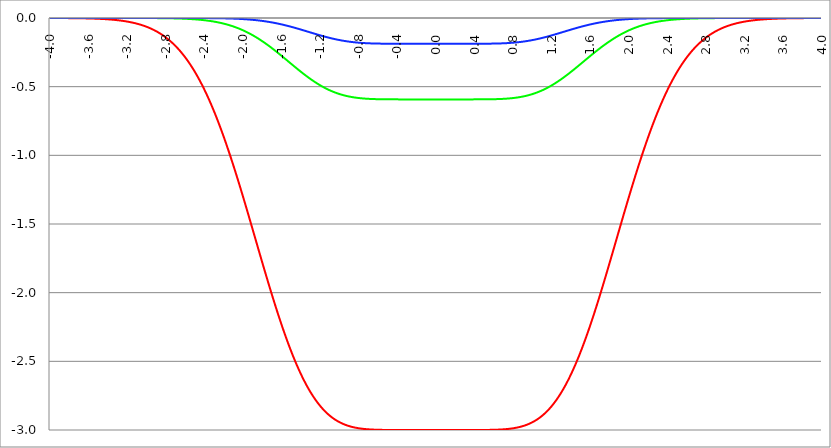
| Category | Series 1 | Series 0 | Series 2 |
|---|---|---|---|
| -4.0 | 0 | 0 | 0 |
| -3.996 | 0 | 0 | 0 |
| -3.992 | 0 | 0 | 0 |
| -3.988 | 0 | 0 | 0 |
| -3.984 | 0 | 0 | 0 |
| -3.98 | 0 | 0 | 0 |
| -3.976 | 0 | 0 | 0 |
| -3.972 | 0 | 0 | 0 |
| -3.968 | 0 | 0 | 0 |
| -3.964 | 0 | 0 | 0 |
| -3.96 | 0 | 0 | 0 |
| -3.956 | 0 | 0 | 0 |
| -3.952 | 0 | 0 | 0 |
| -3.948 | 0 | 0 | 0 |
| -3.944 | 0 | 0 | 0 |
| -3.94 | 0 | 0 | 0 |
| -3.936 | 0 | 0 | 0 |
| -3.932 | 0 | 0 | 0 |
| -3.928 | 0 | 0 | 0 |
| -3.924 | 0 | 0 | 0 |
| -3.92 | 0 | 0 | 0 |
| -3.916 | 0 | 0 | 0 |
| -3.912 | 0 | 0 | 0 |
| -3.908 | -0.001 | 0 | 0 |
| -3.904 | -0.001 | 0 | 0 |
| -3.9 | -0.001 | 0 | 0 |
| -3.896 | -0.001 | 0 | 0 |
| -3.892 | -0.001 | 0 | 0 |
| -3.888 | -0.001 | 0 | 0 |
| -3.884 | -0.001 | 0 | 0 |
| -3.88 | -0.001 | 0 | 0 |
| -3.876 | -0.001 | 0 | 0 |
| -3.872 | -0.001 | 0 | 0 |
| -3.868 | -0.001 | 0 | 0 |
| -3.864 | -0.001 | 0 | 0 |
| -3.86 | -0.001 | 0 | 0 |
| -3.856 | -0.001 | 0 | 0 |
| -3.852 | -0.001 | 0 | 0 |
| -3.848 | -0.001 | 0 | 0 |
| -3.844 | -0.001 | 0 | 0 |
| -3.84 | -0.001 | 0 | 0 |
| -3.836 | -0.001 | 0 | 0 |
| -3.832 | -0.001 | 0 | 0 |
| -3.828 | -0.001 | 0 | 0 |
| -3.824 | -0.001 | 0 | 0 |
| -3.82 | -0.001 | 0 | 0 |
| -3.816 | -0.001 | 0 | 0 |
| -3.812 | -0.001 | 0 | 0 |
| -3.808 | -0.001 | 0 | 0 |
| -3.804 | -0.001 | 0 | 0 |
| -3.8 | -0.001 | 0 | 0 |
| -3.796 | -0.001 | 0 | 0 |
| -3.792 | -0.001 | 0 | 0 |
| -3.788 | -0.001 | 0 | 0 |
| -3.784 | -0.001 | 0 | 0 |
| -3.78 | -0.001 | 0 | 0 |
| -3.776 | -0.001 | 0 | 0 |
| -3.772 | -0.001 | 0 | 0 |
| -3.768 | -0.001 | 0 | 0 |
| -3.764 | -0.001 | 0 | 0 |
| -3.76 | -0.001 | 0 | 0 |
| -3.756 | -0.001 | 0 | 0 |
| -3.752 | -0.001 | 0 | 0 |
| -3.748 | -0.001 | 0 | 0 |
| -3.744 | -0.001 | 0 | 0 |
| -3.74 | -0.001 | 0 | 0 |
| -3.736 | -0.001 | 0 | 0 |
| -3.732 | -0.002 | 0 | 0 |
| -3.728 | -0.002 | 0 | 0 |
| -3.724 | -0.002 | 0 | 0 |
| -3.72 | -0.002 | 0 | 0 |
| -3.716 | -0.002 | 0 | 0 |
| -3.712 | -0.002 | 0 | 0 |
| -3.708 | -0.002 | 0 | 0 |
| -3.704 | -0.002 | 0 | 0 |
| -3.7 | -0.002 | 0 | 0 |
| -3.696 | -0.002 | 0 | 0 |
| -3.692 | -0.002 | 0 | 0 |
| -3.688 | -0.002 | 0 | 0 |
| -3.684 | -0.002 | 0 | 0 |
| -3.68 | -0.002 | 0 | 0 |
| -3.676 | -0.002 | 0 | 0 |
| -3.672 | -0.002 | 0 | 0 |
| -3.668 | -0.002 | 0 | 0 |
| -3.664 | -0.002 | 0 | 0 |
| -3.66 | -0.002 | 0 | 0 |
| -3.656 | -0.002 | 0 | 0 |
| -3.652 | -0.002 | 0 | 0 |
| -3.648 | -0.002 | 0 | 0 |
| -3.644 | -0.003 | 0 | 0 |
| -3.64 | -0.003 | 0 | 0 |
| -3.636 | -0.003 | 0 | 0 |
| -3.632 | -0.003 | 0 | 0 |
| -3.628 | -0.003 | 0 | 0 |
| -3.624 | -0.003 | 0 | 0 |
| -3.62 | -0.003 | 0 | 0 |
| -3.616 | -0.003 | 0 | 0 |
| -3.612 | -0.003 | 0 | 0 |
| -3.608 | -0.003 | 0 | 0 |
| -3.604 | -0.003 | 0 | 0 |
| -3.6 | -0.003 | 0 | 0 |
| -3.596 | -0.003 | 0 | 0 |
| -3.592 | -0.003 | 0 | 0 |
| -3.588 | -0.003 | 0 | 0 |
| -3.584 | -0.004 | 0 | 0 |
| -3.58 | -0.004 | 0 | 0 |
| -3.576 | -0.004 | 0 | 0 |
| -3.572 | -0.004 | 0 | 0 |
| -3.568 | -0.004 | 0 | 0 |
| -3.564 | -0.004 | 0 | 0 |
| -3.56 | -0.004 | 0 | 0 |
| -3.556 | -0.004 | 0 | 0 |
| -3.552 | -0.004 | 0 | 0 |
| -3.548 | -0.004 | 0 | 0 |
| -3.544 | -0.004 | 0 | 0 |
| -3.54 | -0.005 | 0 | 0 |
| -3.536 | -0.005 | 0 | 0 |
| -3.532 | -0.005 | 0 | 0 |
| -3.528 | -0.005 | 0 | 0 |
| -3.524 | -0.005 | 0 | 0 |
| -3.52 | -0.005 | 0 | 0 |
| -3.516 | -0.005 | 0 | 0 |
| -3.512 | -0.005 | 0 | 0 |
| -3.508 | -0.005 | 0 | 0 |
| -3.504 | -0.006 | 0 | 0 |
| -3.5 | -0.006 | 0 | 0 |
| -3.496 | -0.006 | 0 | 0 |
| -3.492 | -0.006 | 0 | 0 |
| -3.488 | -0.006 | 0 | 0 |
| -3.484 | -0.006 | 0 | 0 |
| -3.48 | -0.006 | 0 | 0 |
| -3.476 | -0.006 | 0 | 0 |
| -3.472 | -0.007 | 0 | 0 |
| -3.467999999999999 | -0.007 | 0 | 0 |
| -3.463999999999999 | -0.007 | 0 | 0 |
| -3.459999999999999 | -0.007 | 0 | 0 |
| -3.455999999999999 | -0.007 | 0 | 0 |
| -3.451999999999999 | -0.007 | 0 | 0 |
| -3.447999999999999 | -0.007 | 0 | 0 |
| -3.443999999999999 | -0.008 | 0 | 0 |
| -3.439999999999999 | -0.008 | 0 | 0 |
| -3.435999999999999 | -0.008 | 0 | 0 |
| -3.431999999999999 | -0.008 | 0 | 0 |
| -3.427999999999999 | -0.008 | 0 | 0 |
| -3.423999999999999 | -0.009 | 0 | 0 |
| -3.419999999999999 | -0.009 | 0 | 0 |
| -3.415999999999999 | -0.009 | 0 | 0 |
| -3.411999999999999 | -0.009 | 0 | 0 |
| -3.407999999999999 | -0.009 | 0 | 0 |
| -3.403999999999999 | -0.009 | 0 | 0 |
| -3.399999999999999 | -0.01 | 0 | 0 |
| -3.395999999999999 | -0.01 | 0 | 0 |
| -3.391999999999999 | -0.01 | 0 | 0 |
| -3.387999999999999 | -0.01 | 0 | 0 |
| -3.383999999999999 | -0.01 | 0 | 0 |
| -3.379999999999999 | -0.011 | 0 | 0 |
| -3.375999999999999 | -0.011 | 0 | 0 |
| -3.371999999999999 | -0.011 | 0 | 0 |
| -3.367999999999999 | -0.011 | 0 | 0 |
| -3.363999999999999 | -0.012 | 0 | 0 |
| -3.359999999999999 | -0.012 | 0 | 0 |
| -3.355999999999999 | -0.012 | 0 | 0 |
| -3.351999999999999 | -0.012 | 0 | 0 |
| -3.347999999999999 | -0.013 | 0 | 0 |
| -3.343999999999999 | -0.013 | 0 | 0 |
| -3.339999999999999 | -0.013 | 0 | 0 |
| -3.335999999999999 | -0.013 | 0 | 0 |
| -3.331999999999999 | -0.014 | 0 | 0 |
| -3.327999999999999 | -0.014 | 0 | 0 |
| -3.323999999999999 | -0.014 | 0 | 0 |
| -3.319999999999999 | -0.015 | 0 | 0 |
| -3.315999999999999 | -0.015 | 0 | 0 |
| -3.311999999999999 | -0.015 | 0 | 0 |
| -3.307999999999999 | -0.015 | 0 | 0 |
| -3.303999999999999 | -0.016 | 0 | 0 |
| -3.299999999999999 | -0.016 | 0 | 0 |
| -3.295999999999999 | -0.016 | 0 | 0 |
| -3.291999999999999 | -0.017 | 0 | 0 |
| -3.288 | -0.017 | 0 | 0 |
| -3.284 | -0.017 | 0 | 0 |
| -3.279999999999999 | -0.018 | 0 | 0 |
| -3.275999999999999 | -0.018 | 0 | 0 |
| -3.271999999999999 | -0.018 | 0 | 0 |
| -3.268 | -0.019 | 0 | 0 |
| -3.264 | -0.019 | 0 | 0 |
| -3.259999999999999 | -0.019 | 0 | 0 |
| -3.255999999999999 | -0.02 | 0 | 0 |
| -3.251999999999999 | -0.02 | 0 | 0 |
| -3.248 | -0.021 | 0 | 0 |
| -3.244 | -0.021 | 0 | 0 |
| -3.239999999999999 | -0.021 | 0 | 0 |
| -3.235999999999999 | -0.022 | 0 | 0 |
| -3.231999999999999 | -0.022 | 0 | 0 |
| -3.228 | -0.023 | 0 | 0 |
| -3.224 | -0.023 | 0 | 0 |
| -3.219999999999999 | -0.024 | 0 | 0 |
| -3.215999999999999 | -0.024 | 0 | 0 |
| -3.211999999999999 | -0.025 | 0 | 0 |
| -3.208 | -0.025 | 0 | 0 |
| -3.204 | -0.026 | 0 | 0 |
| -3.199999999999999 | -0.026 | 0 | 0 |
| -3.195999999999999 | -0.026 | 0 | 0 |
| -3.191999999999999 | -0.027 | 0 | 0 |
| -3.188 | -0.028 | 0 | 0 |
| -3.184 | -0.028 | 0 | 0 |
| -3.179999999999999 | -0.029 | 0 | 0 |
| -3.175999999999999 | -0.029 | 0 | 0 |
| -3.171999999999999 | -0.03 | 0 | 0 |
| -3.168 | -0.03 | 0 | 0 |
| -3.164 | -0.031 | 0 | 0 |
| -3.159999999999999 | -0.031 | 0 | 0 |
| -3.155999999999999 | -0.032 | 0 | 0 |
| -3.151999999999999 | -0.033 | 0 | 0 |
| -3.148 | -0.033 | 0 | 0 |
| -3.144 | -0.034 | 0 | 0 |
| -3.139999999999999 | -0.034 | 0 | 0 |
| -3.135999999999999 | -0.035 | 0 | 0 |
| -3.131999999999999 | -0.036 | 0 | 0 |
| -3.128 | -0.036 | 0 | 0 |
| -3.124 | -0.037 | 0 | 0 |
| -3.119999999999999 | -0.038 | 0 | 0 |
| -3.115999999999999 | -0.038 | 0 | 0 |
| -3.111999999999999 | -0.039 | 0 | 0 |
| -3.108 | -0.04 | 0 | 0 |
| -3.104 | -0.04 | 0 | 0 |
| -3.099999999999999 | -0.041 | 0 | 0 |
| -3.095999999999999 | -0.042 | 0 | 0 |
| -3.091999999999999 | -0.043 | 0 | 0 |
| -3.088 | -0.043 | 0 | 0 |
| -3.084 | -0.044 | 0 | 0 |
| -3.079999999999999 | -0.045 | 0 | 0 |
| -3.075999999999999 | -0.046 | 0 | 0 |
| -3.071999999999999 | -0.047 | 0 | 0 |
| -3.068 | -0.047 | 0 | 0 |
| -3.064 | -0.048 | 0 | 0 |
| -3.059999999999999 | -0.049 | 0 | 0 |
| -3.055999999999999 | -0.05 | 0 | 0 |
| -3.051999999999999 | -0.051 | 0 | 0 |
| -3.048 | -0.052 | 0 | 0 |
| -3.044 | -0.053 | 0 | 0 |
| -3.039999999999999 | -0.054 | 0 | 0 |
| -3.035999999999999 | -0.055 | 0 | 0 |
| -3.031999999999999 | -0.056 | 0 | 0 |
| -3.028 | -0.056 | 0 | 0 |
| -3.024 | -0.057 | 0 | 0 |
| -3.019999999999999 | -0.058 | 0 | 0 |
| -3.015999999999999 | -0.059 | 0 | 0 |
| -3.011999999999999 | -0.061 | 0 | 0 |
| -3.008 | -0.062 | 0 | 0 |
| -3.004 | -0.063 | 0 | 0 |
| -2.999999999999999 | -0.064 | 0 | 0 |
| -2.995999999999999 | -0.065 | 0 | 0 |
| -2.991999999999999 | -0.066 | 0 | 0 |
| -2.988 | -0.067 | 0 | 0 |
| -2.984 | -0.068 | 0 | 0 |
| -2.979999999999999 | -0.069 | 0 | 0 |
| -2.975999999999999 | -0.07 | 0 | 0 |
| -2.971999999999999 | -0.072 | -0.001 | 0 |
| -2.968 | -0.073 | -0.001 | 0 |
| -2.964 | -0.074 | -0.001 | 0 |
| -2.959999999999999 | -0.075 | -0.001 | 0 |
| -2.955999999999999 | -0.077 | -0.001 | 0 |
| -2.951999999999999 | -0.078 | -0.001 | 0 |
| -2.948 | -0.079 | -0.001 | 0 |
| -2.944 | -0.08 | -0.001 | 0 |
| -2.939999999999999 | -0.082 | -0.001 | 0 |
| -2.935999999999999 | -0.083 | -0.001 | 0 |
| -2.931999999999999 | -0.084 | -0.001 | 0 |
| -2.928 | -0.086 | -0.001 | 0 |
| -2.924 | -0.087 | -0.001 | 0 |
| -2.919999999999999 | -0.089 | -0.001 | 0 |
| -2.915999999999999 | -0.09 | -0.001 | 0 |
| -2.911999999999999 | -0.092 | -0.001 | 0 |
| -2.908 | -0.093 | -0.001 | 0 |
| -2.904 | -0.095 | -0.001 | 0 |
| -2.899999999999999 | -0.096 | -0.001 | 0 |
| -2.895999999999999 | -0.098 | -0.001 | 0 |
| -2.891999999999999 | -0.099 | -0.001 | 0 |
| -2.887999999999999 | -0.101 | -0.001 | 0 |
| -2.883999999999999 | -0.102 | -0.001 | 0 |
| -2.879999999999999 | -0.104 | -0.001 | 0 |
| -2.875999999999999 | -0.106 | -0.001 | 0 |
| -2.871999999999999 | -0.107 | -0.001 | 0 |
| -2.867999999999999 | -0.109 | -0.001 | 0 |
| -2.863999999999999 | -0.111 | -0.001 | 0 |
| -2.859999999999999 | -0.113 | -0.001 | 0 |
| -2.855999999999999 | -0.114 | -0.001 | 0 |
| -2.851999999999999 | -0.116 | -0.001 | 0 |
| -2.847999999999999 | -0.118 | -0.001 | 0 |
| -2.843999999999999 | -0.12 | -0.001 | 0 |
| -2.839999999999999 | -0.122 | -0.001 | 0 |
| -2.835999999999999 | -0.124 | -0.001 | 0 |
| -2.831999999999999 | -0.125 | -0.001 | 0 |
| -2.827999999999999 | -0.127 | -0.001 | 0 |
| -2.823999999999999 | -0.129 | -0.001 | 0 |
| -2.819999999999999 | -0.131 | -0.001 | 0 |
| -2.815999999999999 | -0.133 | -0.001 | 0 |
| -2.811999999999999 | -0.135 | -0.002 | 0 |
| -2.807999999999999 | -0.137 | -0.002 | 0 |
| -2.803999999999999 | -0.139 | -0.002 | 0 |
| -2.799999999999999 | -0.142 | -0.002 | 0 |
| -2.795999999999999 | -0.144 | -0.002 | 0 |
| -2.791999999999999 | -0.146 | -0.002 | 0 |
| -2.787999999999999 | -0.148 | -0.002 | 0 |
| -2.783999999999999 | -0.15 | -0.002 | 0 |
| -2.779999999999999 | -0.153 | -0.002 | 0 |
| -2.775999999999999 | -0.155 | -0.002 | 0 |
| -2.771999999999999 | -0.157 | -0.002 | 0 |
| -2.767999999999999 | -0.159 | -0.002 | 0 |
| -2.763999999999999 | -0.162 | -0.002 | 0 |
| -2.759999999999999 | -0.164 | -0.002 | 0 |
| -2.755999999999999 | -0.167 | -0.002 | 0 |
| -2.751999999999999 | -0.169 | -0.002 | 0 |
| -2.747999999999999 | -0.172 | -0.002 | 0 |
| -2.743999999999999 | -0.174 | -0.002 | 0 |
| -2.739999999999999 | -0.177 | -0.002 | 0 |
| -2.735999999999999 | -0.179 | -0.002 | 0 |
| -2.731999999999999 | -0.182 | -0.003 | 0 |
| -2.727999999999999 | -0.184 | -0.003 | 0 |
| -2.723999999999999 | -0.187 | -0.003 | 0 |
| -2.719999999999999 | -0.19 | -0.003 | 0 |
| -2.715999999999999 | -0.192 | -0.003 | 0 |
| -2.711999999999999 | -0.195 | -0.003 | 0 |
| -2.707999999999999 | -0.198 | -0.003 | 0 |
| -2.703999999999999 | -0.201 | -0.003 | 0 |
| -2.699999999999999 | -0.204 | -0.003 | 0 |
| -2.695999999999999 | -0.206 | -0.003 | 0 |
| -2.691999999999999 | -0.209 | -0.003 | 0 |
| -2.687999999999999 | -0.212 | -0.003 | 0 |
| -2.683999999999999 | -0.215 | -0.003 | 0 |
| -2.679999999999999 | -0.218 | -0.003 | 0 |
| -2.675999999999999 | -0.221 | -0.004 | 0 |
| -2.671999999999999 | -0.224 | -0.004 | 0 |
| -2.667999999999999 | -0.227 | -0.004 | 0 |
| -2.663999999999999 | -0.231 | -0.004 | 0 |
| -2.659999999999999 | -0.234 | -0.004 | 0 |
| -2.655999999999999 | -0.237 | -0.004 | 0 |
| -2.651999999999999 | -0.24 | -0.004 | 0 |
| -2.647999999999999 | -0.243 | -0.004 | 0 |
| -2.643999999999999 | -0.247 | -0.004 | 0 |
| -2.639999999999999 | -0.25 | -0.004 | 0 |
| -2.635999999999999 | -0.253 | -0.004 | 0 |
| -2.631999999999999 | -0.257 | -0.005 | 0 |
| -2.627999999999999 | -0.26 | -0.005 | 0 |
| -2.623999999999999 | -0.264 | -0.005 | 0 |
| -2.619999999999999 | -0.267 | -0.005 | 0 |
| -2.615999999999999 | -0.271 | -0.005 | 0 |
| -2.611999999999999 | -0.274 | -0.005 | 0 |
| -2.607999999999999 | -0.278 | -0.005 | 0 |
| -2.603999999999999 | -0.282 | -0.005 | 0 |
| -2.599999999999999 | -0.285 | -0.006 | 0 |
| -2.595999999999999 | -0.289 | -0.006 | 0 |
| -2.591999999999999 | -0.293 | -0.006 | 0 |
| -2.587999999999999 | -0.297 | -0.006 | 0 |
| -2.583999999999999 | -0.301 | -0.006 | 0 |
| -2.579999999999999 | -0.305 | -0.006 | 0 |
| -2.575999999999999 | -0.309 | -0.006 | 0 |
| -2.571999999999999 | -0.312 | -0.006 | 0 |
| -2.567999999999999 | -0.317 | -0.007 | 0 |
| -2.563999999999999 | -0.321 | -0.007 | 0 |
| -2.559999999999999 | -0.325 | -0.007 | 0 |
| -2.555999999999999 | -0.329 | -0.007 | 0 |
| -2.551999999999999 | -0.333 | -0.007 | 0 |
| -2.547999999999999 | -0.337 | -0.007 | 0 |
| -2.543999999999999 | -0.341 | -0.008 | 0 |
| -2.539999999999999 | -0.346 | -0.008 | 0 |
| -2.535999999999999 | -0.35 | -0.008 | 0 |
| -2.531999999999999 | -0.354 | -0.008 | 0 |
| -2.527999999999999 | -0.359 | -0.008 | 0 |
| -2.523999999999999 | -0.363 | -0.008 | 0 |
| -2.519999999999999 | -0.368 | -0.009 | 0 |
| -2.515999999999999 | -0.372 | -0.009 | 0 |
| -2.511999999999999 | -0.377 | -0.009 | 0 |
| -2.507999999999999 | -0.381 | -0.009 | 0 |
| -2.503999999999999 | -0.386 | -0.009 | 0 |
| -2.499999999999999 | -0.391 | -0.01 | 0 |
| -2.495999999999999 | -0.395 | -0.01 | 0 |
| -2.491999999999999 | -0.4 | -0.01 | 0 |
| -2.487999999999999 | -0.405 | -0.01 | 0 |
| -2.483999999999999 | -0.41 | -0.01 | 0 |
| -2.479999999999999 | -0.415 | -0.011 | 0 |
| -2.475999999999999 | -0.42 | -0.011 | 0 |
| -2.471999999999999 | -0.425 | -0.011 | 0 |
| -2.467999999999999 | -0.43 | -0.011 | 0 |
| -2.463999999999999 | -0.435 | -0.012 | 0 |
| -2.459999999999999 | -0.44 | -0.012 | 0 |
| -2.455999999999999 | -0.445 | -0.012 | 0 |
| -2.451999999999999 | -0.45 | -0.012 | 0 |
| -2.447999999999999 | -0.456 | -0.013 | 0 |
| -2.443999999999999 | -0.461 | -0.013 | 0 |
| -2.439999999999999 | -0.466 | -0.013 | 0 |
| -2.435999999999999 | -0.472 | -0.013 | 0 |
| -2.431999999999999 | -0.477 | -0.014 | 0 |
| -2.427999999999999 | -0.482 | -0.014 | -0.001 |
| -2.423999999999999 | -0.488 | -0.014 | -0.001 |
| -2.419999999999999 | -0.493 | -0.015 | -0.001 |
| -2.415999999999999 | -0.499 | -0.015 | -0.001 |
| -2.411999999999999 | -0.505 | -0.015 | -0.001 |
| -2.407999999999999 | -0.51 | -0.016 | -0.001 |
| -2.403999999999999 | -0.516 | -0.016 | -0.001 |
| -2.399999999999999 | -0.522 | -0.016 | -0.001 |
| -2.395999999999999 | -0.528 | -0.017 | -0.001 |
| -2.391999999999999 | -0.533 | -0.017 | -0.001 |
| -2.387999999999999 | -0.539 | -0.017 | -0.001 |
| -2.383999999999999 | -0.545 | -0.018 | -0.001 |
| -2.379999999999999 | -0.551 | -0.018 | -0.001 |
| -2.375999999999999 | -0.557 | -0.018 | -0.001 |
| -2.371999999999999 | -0.563 | -0.019 | -0.001 |
| -2.367999999999998 | -0.569 | -0.019 | -0.001 |
| -2.363999999999998 | -0.576 | -0.019 | -0.001 |
| -2.359999999999998 | -0.582 | -0.02 | -0.001 |
| -2.355999999999998 | -0.588 | -0.02 | -0.001 |
| -2.351999999999998 | -0.594 | -0.021 | -0.001 |
| -2.347999999999998 | -0.601 | -0.021 | -0.001 |
| -2.343999999999998 | -0.607 | -0.021 | -0.001 |
| -2.339999999999998 | -0.613 | -0.022 | -0.001 |
| -2.335999999999998 | -0.62 | -0.022 | -0.001 |
| -2.331999999999998 | -0.626 | -0.023 | -0.001 |
| -2.327999999999998 | -0.633 | -0.023 | -0.001 |
| -2.323999999999998 | -0.64 | -0.023 | -0.001 |
| -2.319999999999998 | -0.646 | -0.024 | -0.001 |
| -2.315999999999998 | -0.653 | -0.024 | -0.001 |
| -2.311999999999998 | -0.66 | -0.025 | -0.001 |
| -2.307999999999998 | -0.666 | -0.025 | -0.001 |
| -2.303999999999998 | -0.673 | -0.026 | -0.001 |
| -2.299999999999998 | -0.68 | -0.026 | -0.001 |
| -2.295999999999998 | -0.687 | -0.027 | -0.001 |
| -2.291999999999998 | -0.694 | -0.027 | -0.001 |
| -2.287999999999998 | -0.701 | -0.028 | -0.001 |
| -2.283999999999998 | -0.708 | -0.028 | -0.001 |
| -2.279999999999998 | -0.715 | -0.029 | -0.001 |
| -2.275999999999998 | -0.722 | -0.029 | -0.001 |
| -2.271999999999998 | -0.729 | -0.03 | -0.002 |
| -2.267999999999998 | -0.736 | -0.03 | -0.002 |
| -2.263999999999998 | -0.743 | -0.031 | -0.002 |
| -2.259999999999998 | -0.751 | -0.032 | -0.002 |
| -2.255999999999998 | -0.758 | -0.032 | -0.002 |
| -2.251999999999998 | -0.765 | -0.033 | -0.002 |
| -2.247999999999998 | -0.773 | -0.033 | -0.002 |
| -2.243999999999998 | -0.78 | -0.034 | -0.002 |
| -2.239999999999998 | -0.788 | -0.034 | -0.002 |
| -2.235999999999998 | -0.795 | -0.035 | -0.002 |
| -2.231999999999998 | -0.803 | -0.036 | -0.002 |
| -2.227999999999998 | -0.81 | -0.036 | -0.002 |
| -2.223999999999998 | -0.818 | -0.037 | -0.002 |
| -2.219999999999998 | -0.826 | -0.038 | -0.002 |
| -2.215999999999998 | -0.833 | -0.038 | -0.002 |
| -2.211999999999998 | -0.841 | -0.039 | -0.002 |
| -2.207999999999998 | -0.849 | -0.04 | -0.002 |
| -2.203999999999998 | -0.857 | -0.04 | -0.002 |
| -2.199999999999998 | -0.865 | -0.041 | -0.002 |
| -2.195999999999998 | -0.873 | -0.042 | -0.003 |
| -2.191999999999998 | -0.88 | -0.042 | -0.003 |
| -2.187999999999998 | -0.888 | -0.043 | -0.003 |
| -2.183999999999998 | -0.896 | -0.044 | -0.003 |
| -2.179999999999998 | -0.905 | -0.045 | -0.003 |
| -2.175999999999998 | -0.913 | -0.045 | -0.003 |
| -2.171999999999998 | -0.921 | -0.046 | -0.003 |
| -2.167999999999998 | -0.929 | -0.047 | -0.003 |
| -2.163999999999998 | -0.937 | -0.048 | -0.003 |
| -2.159999999999998 | -0.945 | -0.049 | -0.003 |
| -2.155999999999998 | -0.954 | -0.049 | -0.003 |
| -2.151999999999998 | -0.962 | -0.05 | -0.003 |
| -2.147999999999998 | -0.97 | -0.051 | -0.003 |
| -2.143999999999998 | -0.979 | -0.052 | -0.003 |
| -2.139999999999998 | -0.987 | -0.053 | -0.004 |
| -2.135999999999998 | -0.996 | -0.054 | -0.004 |
| -2.131999999999998 | -1.004 | -0.054 | -0.004 |
| -2.127999999999998 | -1.013 | -0.055 | -0.004 |
| -2.123999999999998 | -1.021 | -0.056 | -0.004 |
| -2.119999999999998 | -1.03 | -0.057 | -0.004 |
| -2.115999999999998 | -1.038 | -0.058 | -0.004 |
| -2.111999999999998 | -1.047 | -0.059 | -0.004 |
| -2.107999999999998 | -1.056 | -0.06 | -0.004 |
| -2.103999999999998 | -1.064 | -0.061 | -0.004 |
| -2.099999999999998 | -1.073 | -0.062 | -0.005 |
| -2.095999999999998 | -1.082 | -0.063 | -0.005 |
| -2.091999999999998 | -1.091 | -0.064 | -0.005 |
| -2.087999999999998 | -1.1 | -0.065 | -0.005 |
| -2.083999999999998 | -1.108 | -0.066 | -0.005 |
| -2.079999999999998 | -1.117 | -0.067 | -0.005 |
| -2.075999999999998 | -1.126 | -0.068 | -0.005 |
| -2.071999999999998 | -1.135 | -0.069 | -0.005 |
| -2.067999999999998 | -1.144 | -0.07 | -0.005 |
| -2.063999999999998 | -1.153 | -0.071 | -0.006 |
| -2.059999999999998 | -1.162 | -0.072 | -0.006 |
| -2.055999999999998 | -1.171 | -0.073 | -0.006 |
| -2.051999999999998 | -1.18 | -0.074 | -0.006 |
| -2.047999999999998 | -1.189 | -0.075 | -0.006 |
| -2.043999999999998 | -1.199 | -0.076 | -0.006 |
| -2.039999999999998 | -1.208 | -0.078 | -0.006 |
| -2.035999999999998 | -1.217 | -0.079 | -0.007 |
| -2.031999999999998 | -1.226 | -0.08 | -0.007 |
| -2.027999999999998 | -1.235 | -0.081 | -0.007 |
| -2.023999999999998 | -1.245 | -0.082 | -0.007 |
| -2.019999999999998 | -1.254 | -0.083 | -0.007 |
| -2.015999999999998 | -1.263 | -0.085 | -0.007 |
| -2.011999999999998 | -1.272 | -0.086 | -0.007 |
| -2.007999999999998 | -1.282 | -0.087 | -0.008 |
| -2.003999999999998 | -1.291 | -0.088 | -0.008 |
| -1.999999999999998 | -1.3 | -0.09 | -0.008 |
| -1.995999999999998 | -1.31 | -0.091 | -0.008 |
| -1.991999999999998 | -1.319 | -0.092 | -0.008 |
| -1.987999999999998 | -1.329 | -0.093 | -0.008 |
| -1.983999999999998 | -1.338 | -0.095 | -0.009 |
| -1.979999999999998 | -1.348 | -0.096 | -0.009 |
| -1.975999999999998 | -1.357 | -0.097 | -0.009 |
| -1.971999999999998 | -1.366 | -0.099 | -0.009 |
| -1.967999999999998 | -1.376 | -0.1 | -0.009 |
| -1.963999999999998 | -1.386 | -0.102 | -0.01 |
| -1.959999999999998 | -1.395 | -0.103 | -0.01 |
| -1.955999999999998 | -1.405 | -0.104 | -0.01 |
| -1.951999999999998 | -1.414 | -0.106 | -0.01 |
| -1.947999999999998 | -1.424 | -0.107 | -0.01 |
| -1.943999999999998 | -1.433 | -0.109 | -0.011 |
| -1.939999999999998 | -1.443 | -0.11 | -0.011 |
| -1.935999999999998 | -1.452 | -0.112 | -0.011 |
| -1.931999999999998 | -1.462 | -0.113 | -0.011 |
| -1.927999999999998 | -1.472 | -0.115 | -0.012 |
| -1.923999999999998 | -1.481 | -0.116 | -0.012 |
| -1.919999999999998 | -1.491 | -0.118 | -0.012 |
| -1.915999999999998 | -1.501 | -0.119 | -0.012 |
| -1.911999999999998 | -1.51 | -0.121 | -0.013 |
| -1.907999999999998 | -1.52 | -0.122 | -0.013 |
| -1.903999999999998 | -1.53 | -0.124 | -0.013 |
| -1.899999999999998 | -1.539 | -0.125 | -0.013 |
| -1.895999999999998 | -1.549 | -0.127 | -0.014 |
| -1.891999999999998 | -1.559 | -0.129 | -0.014 |
| -1.887999999999998 | -1.568 | -0.13 | -0.014 |
| -1.883999999999998 | -1.578 | -0.132 | -0.014 |
| -1.879999999999998 | -1.588 | -0.133 | -0.015 |
| -1.875999999999998 | -1.597 | -0.135 | -0.015 |
| -1.871999999999998 | -1.607 | -0.137 | -0.015 |
| -1.867999999999998 | -1.617 | -0.138 | -0.016 |
| -1.863999999999998 | -1.626 | -0.14 | -0.016 |
| -1.859999999999998 | -1.636 | -0.142 | -0.016 |
| -1.855999999999998 | -1.646 | -0.144 | -0.016 |
| -1.851999999999998 | -1.655 | -0.145 | -0.017 |
| -1.847999999999998 | -1.665 | -0.147 | -0.017 |
| -1.843999999999998 | -1.675 | -0.149 | -0.017 |
| -1.839999999999998 | -1.685 | -0.151 | -0.018 |
| -1.835999999999998 | -1.694 | -0.152 | -0.018 |
| -1.831999999999998 | -1.704 | -0.154 | -0.018 |
| -1.827999999999998 | -1.714 | -0.156 | -0.019 |
| -1.823999999999998 | -1.723 | -0.158 | -0.019 |
| -1.819999999999998 | -1.733 | -0.16 | -0.019 |
| -1.815999999999998 | -1.742 | -0.162 | -0.02 |
| -1.811999999999998 | -1.752 | -0.163 | -0.02 |
| -1.807999999999998 | -1.762 | -0.165 | -0.02 |
| -1.803999999999998 | -1.771 | -0.167 | -0.021 |
| -1.799999999999998 | -1.781 | -0.169 | -0.021 |
| -1.795999999999998 | -1.79 | -0.171 | -0.022 |
| -1.791999999999998 | -1.8 | -0.173 | -0.022 |
| -1.787999999999998 | -1.81 | -0.175 | -0.022 |
| -1.783999999999998 | -1.819 | -0.177 | -0.023 |
| -1.779999999999998 | -1.829 | -0.179 | -0.023 |
| -1.775999999999998 | -1.838 | -0.181 | -0.024 |
| -1.771999999999998 | -1.848 | -0.183 | -0.024 |
| -1.767999999999998 | -1.857 | -0.185 | -0.024 |
| -1.763999999999998 | -1.867 | -0.187 | -0.025 |
| -1.759999999999998 | -1.876 | -0.189 | -0.025 |
| -1.755999999999998 | -1.886 | -0.191 | -0.026 |
| -1.751999999999998 | -1.895 | -0.193 | -0.026 |
| -1.747999999999998 | -1.904 | -0.195 | -0.027 |
| -1.743999999999998 | -1.914 | -0.197 | -0.027 |
| -1.739999999999998 | -1.923 | -0.199 | -0.027 |
| -1.735999999999998 | -1.932 | -0.201 | -0.028 |
| -1.731999999999998 | -1.942 | -0.203 | -0.028 |
| -1.727999999999998 | -1.951 | -0.205 | -0.029 |
| -1.723999999999998 | -1.96 | -0.207 | -0.029 |
| -1.719999999999998 | -1.97 | -0.209 | -0.03 |
| -1.715999999999998 | -1.979 | -0.211 | -0.03 |
| -1.711999999999998 | -1.988 | -0.213 | -0.031 |
| -1.707999999999998 | -1.997 | -0.216 | -0.031 |
| -1.703999999999998 | -2.006 | -0.218 | -0.032 |
| -1.699999999999998 | -2.016 | -0.22 | -0.032 |
| -1.695999999999998 | -2.025 | -0.222 | -0.033 |
| -1.691999999999998 | -2.034 | -0.224 | -0.033 |
| -1.687999999999998 | -2.043 | -0.226 | -0.034 |
| -1.683999999999998 | -2.052 | -0.228 | -0.034 |
| -1.679999999999998 | -2.061 | -0.231 | -0.035 |
| -1.675999999999998 | -2.07 | -0.233 | -0.035 |
| -1.671999999999998 | -2.079 | -0.235 | -0.036 |
| -1.667999999999998 | -2.088 | -0.237 | -0.036 |
| -1.663999999999998 | -2.097 | -0.239 | -0.037 |
| -1.659999999999998 | -2.105 | -0.242 | -0.038 |
| -1.655999999999998 | -2.114 | -0.244 | -0.038 |
| -1.651999999999998 | -2.123 | -0.246 | -0.039 |
| -1.647999999999998 | -2.132 | -0.248 | -0.039 |
| -1.643999999999998 | -2.14 | -0.251 | -0.04 |
| -1.639999999999998 | -2.149 | -0.253 | -0.04 |
| -1.635999999999998 | -2.158 | -0.255 | -0.041 |
| -1.631999999999998 | -2.166 | -0.257 | -0.042 |
| -1.627999999999998 | -2.175 | -0.26 | -0.042 |
| -1.623999999999998 | -2.184 | -0.262 | -0.043 |
| -1.619999999999998 | -2.192 | -0.264 | -0.043 |
| -1.615999999999998 | -2.201 | -0.267 | -0.044 |
| -1.611999999999998 | -2.209 | -0.269 | -0.045 |
| -1.607999999999998 | -2.217 | -0.271 | -0.045 |
| -1.603999999999998 | -2.226 | -0.273 | -0.046 |
| -1.599999999999998 | -2.234 | -0.276 | -0.047 |
| -1.595999999999998 | -2.242 | -0.278 | -0.047 |
| -1.591999999999998 | -2.251 | -0.28 | -0.048 |
| -1.587999999999998 | -2.259 | -0.283 | -0.049 |
| -1.583999999999998 | -2.267 | -0.285 | -0.049 |
| -1.579999999999998 | -2.275 | -0.287 | -0.05 |
| -1.575999999999998 | -2.283 | -0.29 | -0.051 |
| -1.571999999999998 | -2.291 | -0.292 | -0.051 |
| -1.567999999999998 | -2.299 | -0.294 | -0.052 |
| -1.563999999999998 | -2.307 | -0.297 | -0.053 |
| -1.559999999999998 | -2.315 | -0.299 | -0.053 |
| -1.555999999999998 | -2.323 | -0.301 | -0.054 |
| -1.551999999999998 | -2.331 | -0.304 | -0.055 |
| -1.547999999999998 | -2.338 | -0.306 | -0.055 |
| -1.543999999999998 | -2.346 | -0.308 | -0.056 |
| -1.539999999999998 | -2.354 | -0.311 | -0.057 |
| -1.535999999999998 | -2.362 | -0.313 | -0.058 |
| -1.531999999999998 | -2.369 | -0.315 | -0.058 |
| -1.527999999999998 | -2.377 | -0.318 | -0.059 |
| -1.523999999999998 | -2.384 | -0.32 | -0.06 |
| -1.519999999999998 | -2.392 | -0.322 | -0.06 |
| -1.515999999999998 | -2.399 | -0.325 | -0.061 |
| -1.511999999999998 | -2.406 | -0.327 | -0.062 |
| -1.507999999999998 | -2.414 | -0.329 | -0.063 |
| -1.503999999999998 | -2.421 | -0.332 | -0.063 |
| -1.499999999999998 | -2.428 | -0.334 | -0.064 |
| -1.495999999999998 | -2.435 | -0.336 | -0.065 |
| -1.491999999999998 | -2.443 | -0.339 | -0.066 |
| -1.487999999999998 | -2.45 | -0.341 | -0.066 |
| -1.483999999999998 | -2.457 | -0.343 | -0.067 |
| -1.479999999999998 | -2.464 | -0.346 | -0.068 |
| -1.475999999999998 | -2.471 | -0.348 | -0.069 |
| -1.471999999999998 | -2.478 | -0.35 | -0.07 |
| -1.467999999999998 | -2.484 | -0.353 | -0.07 |
| -1.463999999999998 | -2.491 | -0.355 | -0.071 |
| -1.459999999999998 | -2.498 | -0.357 | -0.072 |
| -1.455999999999998 | -2.505 | -0.36 | -0.073 |
| -1.451999999999998 | -2.511 | -0.362 | -0.074 |
| -1.447999999999998 | -2.518 | -0.364 | -0.074 |
| -1.443999999999998 | -2.524 | -0.367 | -0.075 |
| -1.439999999999998 | -2.531 | -0.369 | -0.076 |
| -1.435999999999998 | -2.537 | -0.371 | -0.077 |
| -1.431999999999998 | -2.544 | -0.373 | -0.078 |
| -1.427999999999998 | -2.55 | -0.376 | -0.078 |
| -1.423999999999998 | -2.556 | -0.378 | -0.079 |
| -1.419999999999998 | -2.562 | -0.38 | -0.08 |
| -1.415999999999998 | -2.569 | -0.383 | -0.081 |
| -1.411999999999998 | -2.575 | -0.385 | -0.082 |
| -1.407999999999998 | -2.581 | -0.387 | -0.083 |
| -1.403999999999998 | -2.587 | -0.389 | -0.083 |
| -1.399999999999998 | -2.593 | -0.392 | -0.084 |
| -1.395999999999998 | -2.599 | -0.394 | -0.085 |
| -1.391999999999998 | -2.605 | -0.396 | -0.086 |
| -1.387999999999998 | -2.61 | -0.398 | -0.087 |
| -1.383999999999998 | -2.616 | -0.4 | -0.088 |
| -1.379999999999998 | -2.622 | -0.403 | -0.088 |
| -1.375999999999998 | -2.627 | -0.405 | -0.089 |
| -1.371999999999998 | -2.633 | -0.407 | -0.09 |
| -1.367999999999998 | -2.639 | -0.409 | -0.091 |
| -1.363999999999998 | -2.644 | -0.411 | -0.092 |
| -1.359999999999998 | -2.65 | -0.413 | -0.093 |
| -1.355999999999998 | -2.655 | -0.416 | -0.094 |
| -1.351999999999998 | -2.66 | -0.418 | -0.094 |
| -1.347999999999998 | -2.666 | -0.42 | -0.095 |
| -1.343999999999998 | -2.671 | -0.422 | -0.096 |
| -1.339999999999998 | -2.676 | -0.424 | -0.097 |
| -1.335999999999998 | -2.681 | -0.426 | -0.098 |
| -1.331999999999998 | -2.686 | -0.428 | -0.099 |
| -1.327999999999998 | -2.691 | -0.43 | -0.1 |
| -1.323999999999998 | -2.696 | -0.432 | -0.1 |
| -1.319999999999998 | -2.701 | -0.434 | -0.101 |
| -1.315999999999998 | -2.706 | -0.436 | -0.102 |
| -1.311999999999998 | -2.711 | -0.438 | -0.103 |
| -1.307999999999998 | -2.716 | -0.44 | -0.104 |
| -1.303999999999998 | -2.72 | -0.442 | -0.105 |
| -1.299999999999998 | -2.725 | -0.444 | -0.106 |
| -1.295999999999998 | -2.73 | -0.446 | -0.106 |
| -1.291999999999998 | -2.734 | -0.448 | -0.107 |
| -1.287999999999998 | -2.739 | -0.45 | -0.108 |
| -1.283999999999998 | -2.743 | -0.452 | -0.109 |
| -1.279999999999998 | -2.747 | -0.454 | -0.11 |
| -1.275999999999998 | -2.752 | -0.456 | -0.111 |
| -1.271999999999998 | -2.756 | -0.458 | -0.111 |
| -1.267999999999998 | -2.76 | -0.46 | -0.112 |
| -1.263999999999998 | -2.765 | -0.462 | -0.113 |
| -1.259999999999998 | -2.769 | -0.464 | -0.114 |
| -1.255999999999998 | -2.773 | -0.466 | -0.115 |
| -1.251999999999998 | -2.777 | -0.467 | -0.116 |
| -1.247999999999998 | -2.781 | -0.469 | -0.117 |
| -1.243999999999998 | -2.785 | -0.471 | -0.117 |
| -1.239999999999998 | -2.789 | -0.473 | -0.118 |
| -1.235999999999998 | -2.793 | -0.475 | -0.119 |
| -1.231999999999998 | -2.796 | -0.476 | -0.12 |
| -1.227999999999998 | -2.8 | -0.478 | -0.121 |
| -1.223999999999998 | -2.804 | -0.48 | -0.122 |
| -1.219999999999998 | -2.807 | -0.482 | -0.122 |
| -1.215999999999998 | -2.811 | -0.483 | -0.123 |
| -1.211999999999998 | -2.815 | -0.485 | -0.124 |
| -1.207999999999998 | -2.818 | -0.487 | -0.125 |
| -1.203999999999998 | -2.822 | -0.489 | -0.126 |
| -1.199999999999997 | -2.825 | -0.49 | -0.126 |
| -1.195999999999997 | -2.828 | -0.492 | -0.127 |
| -1.191999999999997 | -2.832 | -0.493 | -0.128 |
| -1.187999999999997 | -2.835 | -0.495 | -0.129 |
| -1.183999999999997 | -2.838 | -0.497 | -0.13 |
| -1.179999999999997 | -2.841 | -0.498 | -0.13 |
| -1.175999999999997 | -2.845 | -0.5 | -0.131 |
| -1.171999999999997 | -2.848 | -0.501 | -0.132 |
| -1.167999999999997 | -2.851 | -0.503 | -0.133 |
| -1.163999999999997 | -2.854 | -0.504 | -0.133 |
| -1.159999999999997 | -2.857 | -0.506 | -0.134 |
| -1.155999999999997 | -2.86 | -0.507 | -0.135 |
| -1.151999999999997 | -2.862 | -0.509 | -0.136 |
| -1.147999999999997 | -2.865 | -0.51 | -0.137 |
| -1.143999999999997 | -2.868 | -0.512 | -0.137 |
| -1.139999999999997 | -2.871 | -0.513 | -0.138 |
| -1.135999999999997 | -2.874 | -0.515 | -0.139 |
| -1.131999999999997 | -2.876 | -0.516 | -0.14 |
| -1.127999999999997 | -2.879 | -0.517 | -0.14 |
| -1.123999999999997 | -2.881 | -0.519 | -0.141 |
| -1.119999999999997 | -2.884 | -0.52 | -0.142 |
| -1.115999999999997 | -2.886 | -0.522 | -0.142 |
| -1.111999999999997 | -2.889 | -0.523 | -0.143 |
| -1.107999999999997 | -2.891 | -0.524 | -0.144 |
| -1.103999999999997 | -2.894 | -0.525 | -0.145 |
| -1.099999999999997 | -2.896 | -0.527 | -0.145 |
| -1.095999999999997 | -2.898 | -0.528 | -0.146 |
| -1.091999999999997 | -2.901 | -0.529 | -0.147 |
| -1.087999999999997 | -2.903 | -0.53 | -0.147 |
| -1.083999999999997 | -2.905 | -0.532 | -0.148 |
| -1.079999999999997 | -2.907 | -0.533 | -0.149 |
| -1.075999999999997 | -2.909 | -0.534 | -0.149 |
| -1.071999999999997 | -2.911 | -0.535 | -0.15 |
| -1.067999999999997 | -2.913 | -0.536 | -0.151 |
| -1.063999999999997 | -2.915 | -0.538 | -0.151 |
| -1.059999999999997 | -2.917 | -0.539 | -0.152 |
| -1.055999999999997 | -2.919 | -0.54 | -0.153 |
| -1.051999999999997 | -2.921 | -0.541 | -0.153 |
| -1.047999999999997 | -2.923 | -0.542 | -0.154 |
| -1.043999999999997 | -2.925 | -0.543 | -0.154 |
| -1.039999999999997 | -2.927 | -0.544 | -0.155 |
| -1.035999999999997 | -2.929 | -0.545 | -0.156 |
| -1.031999999999997 | -2.93 | -0.546 | -0.156 |
| -1.027999999999997 | -2.932 | -0.547 | -0.157 |
| -1.023999999999997 | -2.934 | -0.548 | -0.157 |
| -1.019999999999997 | -2.935 | -0.549 | -0.158 |
| -1.015999999999997 | -2.937 | -0.55 | -0.158 |
| -1.011999999999997 | -2.938 | -0.551 | -0.159 |
| -1.007999999999997 | -2.94 | -0.552 | -0.16 |
| -1.003999999999997 | -2.942 | -0.553 | -0.16 |
| -0.999999999999997 | -2.943 | -0.554 | -0.161 |
| -0.995999999999997 | -2.944 | -0.555 | -0.161 |
| -0.991999999999997 | -2.946 | -0.555 | -0.162 |
| -0.987999999999997 | -2.947 | -0.556 | -0.162 |
| -0.983999999999997 | -2.949 | -0.557 | -0.163 |
| -0.979999999999997 | -2.95 | -0.558 | -0.163 |
| -0.975999999999997 | -2.951 | -0.559 | -0.164 |
| -0.971999999999997 | -2.953 | -0.56 | -0.164 |
| -0.967999999999997 | -2.954 | -0.56 | -0.165 |
| -0.963999999999997 | -2.955 | -0.561 | -0.165 |
| -0.959999999999997 | -2.956 | -0.562 | -0.166 |
| -0.955999999999997 | -2.958 | -0.563 | -0.166 |
| -0.951999999999997 | -2.959 | -0.563 | -0.167 |
| -0.947999999999997 | -2.96 | -0.564 | -0.167 |
| -0.943999999999997 | -2.961 | -0.565 | -0.168 |
| -0.939999999999997 | -2.962 | -0.566 | -0.168 |
| -0.935999999999997 | -2.963 | -0.566 | -0.169 |
| -0.931999999999997 | -2.964 | -0.567 | -0.169 |
| -0.927999999999997 | -2.965 | -0.568 | -0.169 |
| -0.923999999999997 | -2.966 | -0.568 | -0.17 |
| -0.919999999999997 | -2.967 | -0.569 | -0.17 |
| -0.915999999999997 | -2.968 | -0.569 | -0.171 |
| -0.911999999999997 | -2.969 | -0.57 | -0.171 |
| -0.907999999999997 | -2.97 | -0.571 | -0.171 |
| -0.903999999999997 | -2.971 | -0.571 | -0.172 |
| -0.899999999999997 | -2.972 | -0.572 | -0.172 |
| -0.895999999999997 | -2.972 | -0.572 | -0.173 |
| -0.891999999999997 | -2.973 | -0.573 | -0.173 |
| -0.887999999999997 | -2.974 | -0.573 | -0.173 |
| -0.883999999999997 | -2.975 | -0.574 | -0.174 |
| -0.879999999999997 | -2.976 | -0.574 | -0.174 |
| -0.875999999999997 | -2.976 | -0.575 | -0.174 |
| -0.871999999999997 | -2.977 | -0.576 | -0.175 |
| -0.867999999999997 | -2.978 | -0.576 | -0.175 |
| -0.863999999999997 | -2.978 | -0.576 | -0.175 |
| -0.859999999999997 | -2.979 | -0.577 | -0.176 |
| -0.855999999999997 | -2.98 | -0.577 | -0.176 |
| -0.851999999999997 | -2.98 | -0.578 | -0.176 |
| -0.847999999999997 | -2.981 | -0.578 | -0.177 |
| -0.843999999999997 | -2.982 | -0.579 | -0.177 |
| -0.839999999999997 | -2.982 | -0.579 | -0.177 |
| -0.835999999999997 | -2.983 | -0.579 | -0.177 |
| -0.831999999999997 | -2.983 | -0.58 | -0.178 |
| -0.827999999999997 | -2.984 | -0.58 | -0.178 |
| -0.823999999999997 | -2.984 | -0.581 | -0.178 |
| -0.819999999999997 | -2.985 | -0.581 | -0.179 |
| -0.815999999999997 | -2.985 | -0.581 | -0.179 |
| -0.811999999999997 | -2.986 | -0.582 | -0.179 |
| -0.807999999999997 | -2.986 | -0.582 | -0.179 |
| -0.803999999999997 | -2.987 | -0.582 | -0.18 |
| -0.799999999999997 | -2.987 | -0.583 | -0.18 |
| -0.795999999999997 | -2.988 | -0.583 | -0.18 |
| -0.791999999999997 | -2.988 | -0.583 | -0.18 |
| -0.787999999999997 | -2.989 | -0.584 | -0.18 |
| -0.783999999999997 | -2.989 | -0.584 | -0.181 |
| -0.779999999999997 | -2.989 | -0.584 | -0.181 |
| -0.775999999999997 | -2.99 | -0.585 | -0.181 |
| -0.771999999999997 | -2.99 | -0.585 | -0.181 |
| -0.767999999999997 | -2.991 | -0.585 | -0.181 |
| -0.763999999999997 | -2.991 | -0.585 | -0.182 |
| -0.759999999999997 | -2.991 | -0.586 | -0.182 |
| -0.755999999999997 | -2.992 | -0.586 | -0.182 |
| -0.751999999999997 | -2.992 | -0.586 | -0.182 |
| -0.747999999999997 | -2.992 | -0.586 | -0.182 |
| -0.743999999999997 | -2.992 | -0.586 | -0.183 |
| -0.739999999999997 | -2.993 | -0.587 | -0.183 |
| -0.735999999999997 | -2.993 | -0.587 | -0.183 |
| -0.731999999999997 | -2.993 | -0.587 | -0.183 |
| -0.727999999999997 | -2.994 | -0.587 | -0.183 |
| -0.723999999999997 | -2.994 | -0.588 | -0.183 |
| -0.719999999999997 | -2.994 | -0.588 | -0.184 |
| -0.715999999999997 | -2.994 | -0.588 | -0.184 |
| -0.711999999999997 | -2.994 | -0.588 | -0.184 |
| -0.707999999999997 | -2.995 | -0.588 | -0.184 |
| -0.703999999999997 | -2.995 | -0.588 | -0.184 |
| -0.699999999999997 | -2.995 | -0.589 | -0.184 |
| -0.695999999999997 | -2.995 | -0.589 | -0.184 |
| -0.691999999999997 | -2.996 | -0.589 | -0.184 |
| -0.687999999999997 | -2.996 | -0.589 | -0.185 |
| -0.683999999999997 | -2.996 | -0.589 | -0.185 |
| -0.679999999999997 | -2.996 | -0.589 | -0.185 |
| -0.675999999999997 | -2.996 | -0.589 | -0.185 |
| -0.671999999999997 | -2.996 | -0.59 | -0.185 |
| -0.667999999999997 | -2.997 | -0.59 | -0.185 |
| -0.663999999999997 | -2.997 | -0.59 | -0.185 |
| -0.659999999999997 | -2.997 | -0.59 | -0.185 |
| -0.655999999999997 | -2.997 | -0.59 | -0.185 |
| -0.651999999999997 | -2.997 | -0.59 | -0.185 |
| -0.647999999999997 | -2.997 | -0.59 | -0.185 |
| -0.643999999999997 | -2.997 | -0.59 | -0.186 |
| -0.639999999999997 | -2.997 | -0.59 | -0.186 |
| -0.635999999999997 | -2.998 | -0.591 | -0.186 |
| -0.631999999999997 | -2.998 | -0.591 | -0.186 |
| -0.627999999999997 | -2.998 | -0.591 | -0.186 |
| -0.623999999999997 | -2.998 | -0.591 | -0.186 |
| -0.619999999999997 | -2.998 | -0.591 | -0.186 |
| -0.615999999999997 | -2.998 | -0.591 | -0.186 |
| -0.611999999999997 | -2.998 | -0.591 | -0.186 |
| -0.607999999999997 | -2.998 | -0.591 | -0.186 |
| -0.603999999999997 | -2.998 | -0.591 | -0.186 |
| -0.599999999999997 | -2.998 | -0.591 | -0.186 |
| -0.595999999999997 | -2.998 | -0.591 | -0.186 |
| -0.591999999999997 | -2.999 | -0.591 | -0.186 |
| -0.587999999999997 | -2.999 | -0.591 | -0.186 |
| -0.583999999999997 | -2.999 | -0.591 | -0.187 |
| -0.579999999999997 | -2.999 | -0.592 | -0.187 |
| -0.575999999999997 | -2.999 | -0.592 | -0.187 |
| -0.571999999999997 | -2.999 | -0.592 | -0.187 |
| -0.567999999999997 | -2.999 | -0.592 | -0.187 |
| -0.563999999999997 | -2.999 | -0.592 | -0.187 |
| -0.559999999999997 | -2.999 | -0.592 | -0.187 |
| -0.555999999999997 | -2.999 | -0.592 | -0.187 |
| -0.551999999999997 | -2.999 | -0.592 | -0.187 |
| -0.547999999999997 | -2.999 | -0.592 | -0.187 |
| -0.543999999999997 | -2.999 | -0.592 | -0.187 |
| -0.539999999999997 | -2.999 | -0.592 | -0.187 |
| -0.535999999999997 | -2.999 | -0.592 | -0.187 |
| -0.531999999999997 | -2.999 | -0.592 | -0.187 |
| -0.527999999999997 | -2.999 | -0.592 | -0.187 |
| -0.523999999999997 | -2.999 | -0.592 | -0.187 |
| -0.519999999999997 | -2.999 | -0.592 | -0.187 |
| -0.515999999999997 | -2.999 | -0.592 | -0.187 |
| -0.511999999999997 | -3 | -0.592 | -0.187 |
| -0.507999999999997 | -3 | -0.592 | -0.187 |
| -0.503999999999997 | -3 | -0.592 | -0.187 |
| -0.499999999999997 | -3 | -0.592 | -0.187 |
| -0.495999999999997 | -3 | -0.592 | -0.187 |
| -0.491999999999997 | -3 | -0.592 | -0.187 |
| -0.487999999999997 | -3 | -0.592 | -0.187 |
| -0.483999999999997 | -3 | -0.592 | -0.187 |
| -0.479999999999997 | -3 | -0.592 | -0.187 |
| -0.475999999999997 | -3 | -0.592 | -0.187 |
| -0.471999999999997 | -3 | -0.592 | -0.187 |
| -0.467999999999997 | -3 | -0.592 | -0.187 |
| -0.463999999999997 | -3 | -0.592 | -0.187 |
| -0.459999999999997 | -3 | -0.592 | -0.187 |
| -0.455999999999997 | -3 | -0.592 | -0.187 |
| -0.451999999999997 | -3 | -0.592 | -0.187 |
| -0.447999999999997 | -3 | -0.592 | -0.187 |
| -0.443999999999997 | -3 | -0.592 | -0.187 |
| -0.439999999999997 | -3 | -0.592 | -0.187 |
| -0.435999999999997 | -3 | -0.592 | -0.187 |
| -0.431999999999997 | -3 | -0.592 | -0.187 |
| -0.427999999999997 | -3 | -0.592 | -0.187 |
| -0.423999999999997 | -3 | -0.592 | -0.187 |
| -0.419999999999997 | -3 | -0.592 | -0.187 |
| -0.415999999999997 | -3 | -0.593 | -0.187 |
| -0.411999999999997 | -3 | -0.593 | -0.187 |
| -0.407999999999997 | -3 | -0.593 | -0.187 |
| -0.403999999999997 | -3 | -0.593 | -0.187 |
| -0.399999999999997 | -3 | -0.593 | -0.187 |
| -0.395999999999997 | -3 | -0.593 | -0.187 |
| -0.391999999999997 | -3 | -0.593 | -0.187 |
| -0.387999999999997 | -3 | -0.593 | -0.187 |
| -0.383999999999997 | -3 | -0.593 | -0.187 |
| -0.379999999999997 | -3 | -0.593 | -0.187 |
| -0.375999999999997 | -3 | -0.593 | -0.187 |
| -0.371999999999997 | -3 | -0.593 | -0.187 |
| -0.367999999999997 | -3 | -0.593 | -0.187 |
| -0.363999999999997 | -3 | -0.593 | -0.187 |
| -0.359999999999997 | -3 | -0.593 | -0.187 |
| -0.355999999999997 | -3 | -0.593 | -0.187 |
| -0.351999999999997 | -3 | -0.593 | -0.187 |
| -0.347999999999997 | -3 | -0.593 | -0.187 |
| -0.343999999999997 | -3 | -0.593 | -0.187 |
| -0.339999999999997 | -3 | -0.593 | -0.187 |
| -0.335999999999997 | -3 | -0.593 | -0.187 |
| -0.331999999999997 | -3 | -0.593 | -0.187 |
| -0.327999999999997 | -3 | -0.593 | -0.187 |
| -0.323999999999997 | -3 | -0.593 | -0.187 |
| -0.319999999999997 | -3 | -0.593 | -0.187 |
| -0.315999999999997 | -3 | -0.593 | -0.187 |
| -0.311999999999997 | -3 | -0.593 | -0.187 |
| -0.307999999999997 | -3 | -0.593 | -0.187 |
| -0.303999999999997 | -3 | -0.593 | -0.187 |
| -0.299999999999997 | -3 | -0.593 | -0.187 |
| -0.295999999999997 | -3 | -0.593 | -0.187 |
| -0.291999999999997 | -3 | -0.593 | -0.187 |
| -0.287999999999997 | -3 | -0.593 | -0.187 |
| -0.283999999999997 | -3 | -0.593 | -0.187 |
| -0.279999999999997 | -3 | -0.593 | -0.187 |
| -0.275999999999997 | -3 | -0.593 | -0.187 |
| -0.271999999999997 | -3 | -0.593 | -0.187 |
| -0.267999999999997 | -3 | -0.593 | -0.187 |
| -0.263999999999997 | -3 | -0.593 | -0.187 |
| -0.259999999999997 | -3 | -0.593 | -0.187 |
| -0.255999999999997 | -3 | -0.593 | -0.187 |
| -0.251999999999997 | -3 | -0.593 | -0.187 |
| -0.247999999999997 | -3 | -0.593 | -0.187 |
| -0.243999999999997 | -3 | -0.593 | -0.187 |
| -0.239999999999997 | -3 | -0.593 | -0.187 |
| -0.235999999999997 | -3 | -0.593 | -0.187 |
| -0.231999999999997 | -3 | -0.593 | -0.187 |
| -0.227999999999997 | -3 | -0.593 | -0.187 |
| -0.223999999999997 | -3 | -0.593 | -0.187 |
| -0.219999999999997 | -3 | -0.593 | -0.187 |
| -0.215999999999997 | -3 | -0.593 | -0.187 |
| -0.211999999999997 | -3 | -0.593 | -0.187 |
| -0.207999999999997 | -3 | -0.593 | -0.187 |
| -0.203999999999997 | -3 | -0.593 | -0.187 |
| -0.199999999999997 | -3 | -0.593 | -0.187 |
| -0.195999999999997 | -3 | -0.593 | -0.187 |
| -0.191999999999997 | -3 | -0.593 | -0.187 |
| -0.187999999999997 | -3 | -0.593 | -0.187 |
| -0.183999999999997 | -3 | -0.593 | -0.187 |
| -0.179999999999997 | -3 | -0.593 | -0.187 |
| -0.175999999999997 | -3 | -0.593 | -0.187 |
| -0.171999999999997 | -3 | -0.593 | -0.187 |
| -0.167999999999997 | -3 | -0.593 | -0.187 |
| -0.163999999999997 | -3 | -0.593 | -0.187 |
| -0.159999999999997 | -3 | -0.593 | -0.187 |
| -0.155999999999997 | -3 | -0.593 | -0.187 |
| -0.151999999999997 | -3 | -0.593 | -0.187 |
| -0.147999999999997 | -3 | -0.593 | -0.187 |
| -0.143999999999997 | -3 | -0.593 | -0.187 |
| -0.139999999999997 | -3 | -0.593 | -0.187 |
| -0.135999999999997 | -3 | -0.593 | -0.187 |
| -0.131999999999997 | -3 | -0.593 | -0.187 |
| -0.127999999999997 | -3 | -0.593 | -0.187 |
| -0.123999999999997 | -3 | -0.593 | -0.187 |
| -0.119999999999997 | -3 | -0.593 | -0.187 |
| -0.115999999999997 | -3 | -0.593 | -0.187 |
| -0.111999999999997 | -3 | -0.593 | -0.187 |
| -0.107999999999997 | -3 | -0.593 | -0.187 |
| -0.103999999999997 | -3 | -0.593 | -0.187 |
| -0.0999999999999965 | -3 | -0.593 | -0.187 |
| -0.0959999999999965 | -3 | -0.593 | -0.187 |
| -0.0919999999999965 | -3 | -0.593 | -0.187 |
| -0.0879999999999965 | -3 | -0.593 | -0.187 |
| -0.0839999999999965 | -3 | -0.593 | -0.187 |
| -0.0799999999999965 | -3 | -0.593 | -0.187 |
| -0.0759999999999965 | -3 | -0.593 | -0.187 |
| -0.0719999999999965 | -3 | -0.593 | -0.187 |
| -0.0679999999999965 | -3 | -0.593 | -0.187 |
| -0.0639999999999965 | -3 | -0.593 | -0.187 |
| -0.0599999999999965 | -3 | -0.593 | -0.187 |
| -0.0559999999999965 | -3 | -0.593 | -0.187 |
| -0.0519999999999965 | -3 | -0.593 | -0.187 |
| -0.0479999999999965 | -3 | -0.593 | -0.187 |
| -0.0439999999999965 | -3 | -0.593 | -0.187 |
| -0.0399999999999965 | -3 | -0.593 | -0.187 |
| -0.0359999999999965 | -3 | -0.593 | -0.187 |
| -0.0319999999999965 | -3 | -0.593 | -0.187 |
| -0.0279999999999965 | -3 | -0.593 | -0.187 |
| -0.0239999999999965 | -3 | -0.593 | -0.187 |
| -0.0199999999999965 | -3 | -0.593 | -0.187 |
| -0.0159999999999965 | -3 | -0.593 | -0.187 |
| -0.0119999999999965 | -3 | -0.593 | -0.188 |
| -0.00799999999999647 | -3 | -0.593 | -0.188 |
| -0.00399999999999647 | -3 | -0.593 | -0.188 |
| 3.52495810318487e-15 | -3 | -0.593 | -0.188 |
| 0.00400000000000352 | -3 | -0.593 | -0.188 |
| 0.00800000000000352 | -3 | -0.593 | -0.188 |
| 0.0120000000000035 | -3 | -0.593 | -0.188 |
| 0.0160000000000035 | -3 | -0.593 | -0.187 |
| 0.0200000000000035 | -3 | -0.593 | -0.187 |
| 0.0240000000000035 | -3 | -0.593 | -0.187 |
| 0.0280000000000035 | -3 | -0.593 | -0.187 |
| 0.0320000000000035 | -3 | -0.593 | -0.187 |
| 0.0360000000000035 | -3 | -0.593 | -0.187 |
| 0.0400000000000035 | -3 | -0.593 | -0.187 |
| 0.0440000000000035 | -3 | -0.593 | -0.187 |
| 0.0480000000000035 | -3 | -0.593 | -0.187 |
| 0.0520000000000035 | -3 | -0.593 | -0.187 |
| 0.0560000000000035 | -3 | -0.593 | -0.187 |
| 0.0600000000000035 | -3 | -0.593 | -0.187 |
| 0.0640000000000035 | -3 | -0.593 | -0.187 |
| 0.0680000000000035 | -3 | -0.593 | -0.187 |
| 0.0720000000000036 | -3 | -0.593 | -0.187 |
| 0.0760000000000036 | -3 | -0.593 | -0.187 |
| 0.0800000000000036 | -3 | -0.593 | -0.187 |
| 0.0840000000000036 | -3 | -0.593 | -0.187 |
| 0.0880000000000036 | -3 | -0.593 | -0.187 |
| 0.0920000000000036 | -3 | -0.593 | -0.187 |
| 0.0960000000000036 | -3 | -0.593 | -0.187 |
| 0.100000000000004 | -3 | -0.593 | -0.187 |
| 0.104000000000004 | -3 | -0.593 | -0.187 |
| 0.108000000000004 | -3 | -0.593 | -0.187 |
| 0.112000000000004 | -3 | -0.593 | -0.187 |
| 0.116000000000004 | -3 | -0.593 | -0.187 |
| 0.120000000000004 | -3 | -0.593 | -0.187 |
| 0.124000000000004 | -3 | -0.593 | -0.187 |
| 0.128000000000004 | -3 | -0.593 | -0.187 |
| 0.132000000000004 | -3 | -0.593 | -0.187 |
| 0.136000000000004 | -3 | -0.593 | -0.187 |
| 0.140000000000004 | -3 | -0.593 | -0.187 |
| 0.144000000000004 | -3 | -0.593 | -0.187 |
| 0.148000000000004 | -3 | -0.593 | -0.187 |
| 0.152000000000004 | -3 | -0.593 | -0.187 |
| 0.156000000000004 | -3 | -0.593 | -0.187 |
| 0.160000000000004 | -3 | -0.593 | -0.187 |
| 0.164000000000004 | -3 | -0.593 | -0.187 |
| 0.168000000000004 | -3 | -0.593 | -0.187 |
| 0.172000000000004 | -3 | -0.593 | -0.187 |
| 0.176000000000004 | -3 | -0.593 | -0.187 |
| 0.180000000000004 | -3 | -0.593 | -0.187 |
| 0.184000000000004 | -3 | -0.593 | -0.187 |
| 0.188000000000004 | -3 | -0.593 | -0.187 |
| 0.192000000000004 | -3 | -0.593 | -0.187 |
| 0.196000000000004 | -3 | -0.593 | -0.187 |
| 0.200000000000004 | -3 | -0.593 | -0.187 |
| 0.204000000000004 | -3 | -0.593 | -0.187 |
| 0.208000000000004 | -3 | -0.593 | -0.187 |
| 0.212000000000004 | -3 | -0.593 | -0.187 |
| 0.216000000000004 | -3 | -0.593 | -0.187 |
| 0.220000000000004 | -3 | -0.593 | -0.187 |
| 0.224000000000004 | -3 | -0.593 | -0.187 |
| 0.228000000000004 | -3 | -0.593 | -0.187 |
| 0.232000000000004 | -3 | -0.593 | -0.187 |
| 0.236000000000004 | -3 | -0.593 | -0.187 |
| 0.240000000000004 | -3 | -0.593 | -0.187 |
| 0.244000000000004 | -3 | -0.593 | -0.187 |
| 0.248000000000004 | -3 | -0.593 | -0.187 |
| 0.252000000000004 | -3 | -0.593 | -0.187 |
| 0.256000000000004 | -3 | -0.593 | -0.187 |
| 0.260000000000004 | -3 | -0.593 | -0.187 |
| 0.264000000000004 | -3 | -0.593 | -0.187 |
| 0.268000000000004 | -3 | -0.593 | -0.187 |
| 0.272000000000004 | -3 | -0.593 | -0.187 |
| 0.276000000000004 | -3 | -0.593 | -0.187 |
| 0.280000000000004 | -3 | -0.593 | -0.187 |
| 0.284000000000004 | -3 | -0.593 | -0.187 |
| 0.288000000000004 | -3 | -0.593 | -0.187 |
| 0.292000000000004 | -3 | -0.593 | -0.187 |
| 0.296000000000004 | -3 | -0.593 | -0.187 |
| 0.300000000000004 | -3 | -0.593 | -0.187 |
| 0.304000000000004 | -3 | -0.593 | -0.187 |
| 0.308000000000004 | -3 | -0.593 | -0.187 |
| 0.312000000000004 | -3 | -0.593 | -0.187 |
| 0.316000000000004 | -3 | -0.593 | -0.187 |
| 0.320000000000004 | -3 | -0.593 | -0.187 |
| 0.324000000000004 | -3 | -0.593 | -0.187 |
| 0.328000000000004 | -3 | -0.593 | -0.187 |
| 0.332000000000004 | -3 | -0.593 | -0.187 |
| 0.336000000000004 | -3 | -0.593 | -0.187 |
| 0.340000000000004 | -3 | -0.593 | -0.187 |
| 0.344000000000004 | -3 | -0.593 | -0.187 |
| 0.348000000000004 | -3 | -0.593 | -0.187 |
| 0.352000000000004 | -3 | -0.593 | -0.187 |
| 0.356000000000004 | -3 | -0.593 | -0.187 |
| 0.360000000000004 | -3 | -0.593 | -0.187 |
| 0.364000000000004 | -3 | -0.593 | -0.187 |
| 0.368000000000004 | -3 | -0.593 | -0.187 |
| 0.372000000000004 | -3 | -0.593 | -0.187 |
| 0.376000000000004 | -3 | -0.593 | -0.187 |
| 0.380000000000004 | -3 | -0.593 | -0.187 |
| 0.384000000000004 | -3 | -0.593 | -0.187 |
| 0.388000000000004 | -3 | -0.593 | -0.187 |
| 0.392000000000004 | -3 | -0.593 | -0.187 |
| 0.396000000000004 | -3 | -0.593 | -0.187 |
| 0.400000000000004 | -3 | -0.593 | -0.187 |
| 0.404000000000004 | -3 | -0.593 | -0.187 |
| 0.408000000000004 | -3 | -0.593 | -0.187 |
| 0.412000000000004 | -3 | -0.593 | -0.187 |
| 0.416000000000004 | -3 | -0.593 | -0.187 |
| 0.420000000000004 | -3 | -0.592 | -0.187 |
| 0.424000000000004 | -3 | -0.592 | -0.187 |
| 0.428000000000004 | -3 | -0.592 | -0.187 |
| 0.432000000000004 | -3 | -0.592 | -0.187 |
| 0.436000000000004 | -3 | -0.592 | -0.187 |
| 0.440000000000004 | -3 | -0.592 | -0.187 |
| 0.444000000000004 | -3 | -0.592 | -0.187 |
| 0.448000000000004 | -3 | -0.592 | -0.187 |
| 0.452000000000004 | -3 | -0.592 | -0.187 |
| 0.456000000000004 | -3 | -0.592 | -0.187 |
| 0.460000000000004 | -3 | -0.592 | -0.187 |
| 0.464000000000004 | -3 | -0.592 | -0.187 |
| 0.468000000000004 | -3 | -0.592 | -0.187 |
| 0.472000000000004 | -3 | -0.592 | -0.187 |
| 0.476000000000004 | -3 | -0.592 | -0.187 |
| 0.480000000000004 | -3 | -0.592 | -0.187 |
| 0.484000000000004 | -3 | -0.592 | -0.187 |
| 0.488000000000004 | -3 | -0.592 | -0.187 |
| 0.492000000000004 | -3 | -0.592 | -0.187 |
| 0.496000000000004 | -3 | -0.592 | -0.187 |
| 0.500000000000004 | -3 | -0.592 | -0.187 |
| 0.504000000000004 | -3 | -0.592 | -0.187 |
| 0.508000000000004 | -3 | -0.592 | -0.187 |
| 0.512000000000004 | -3 | -0.592 | -0.187 |
| 0.516000000000004 | -2.999 | -0.592 | -0.187 |
| 0.520000000000004 | -2.999 | -0.592 | -0.187 |
| 0.524000000000004 | -2.999 | -0.592 | -0.187 |
| 0.528000000000004 | -2.999 | -0.592 | -0.187 |
| 0.532000000000004 | -2.999 | -0.592 | -0.187 |
| 0.536000000000004 | -2.999 | -0.592 | -0.187 |
| 0.540000000000004 | -2.999 | -0.592 | -0.187 |
| 0.544000000000004 | -2.999 | -0.592 | -0.187 |
| 0.548000000000004 | -2.999 | -0.592 | -0.187 |
| 0.552000000000004 | -2.999 | -0.592 | -0.187 |
| 0.556000000000004 | -2.999 | -0.592 | -0.187 |
| 0.560000000000004 | -2.999 | -0.592 | -0.187 |
| 0.564000000000004 | -2.999 | -0.592 | -0.187 |
| 0.568000000000004 | -2.999 | -0.592 | -0.187 |
| 0.572000000000004 | -2.999 | -0.592 | -0.187 |
| 0.576000000000004 | -2.999 | -0.592 | -0.187 |
| 0.580000000000004 | -2.999 | -0.592 | -0.187 |
| 0.584000000000004 | -2.999 | -0.591 | -0.187 |
| 0.588000000000004 | -2.999 | -0.591 | -0.186 |
| 0.592000000000004 | -2.999 | -0.591 | -0.186 |
| 0.596000000000004 | -2.998 | -0.591 | -0.186 |
| 0.600000000000004 | -2.998 | -0.591 | -0.186 |
| 0.604000000000004 | -2.998 | -0.591 | -0.186 |
| 0.608000000000004 | -2.998 | -0.591 | -0.186 |
| 0.612000000000004 | -2.998 | -0.591 | -0.186 |
| 0.616000000000004 | -2.998 | -0.591 | -0.186 |
| 0.620000000000004 | -2.998 | -0.591 | -0.186 |
| 0.624000000000004 | -2.998 | -0.591 | -0.186 |
| 0.628000000000004 | -2.998 | -0.591 | -0.186 |
| 0.632000000000004 | -2.998 | -0.591 | -0.186 |
| 0.636000000000004 | -2.998 | -0.591 | -0.186 |
| 0.640000000000004 | -2.997 | -0.59 | -0.186 |
| 0.644000000000004 | -2.997 | -0.59 | -0.186 |
| 0.648000000000004 | -2.997 | -0.59 | -0.185 |
| 0.652000000000004 | -2.997 | -0.59 | -0.185 |
| 0.656000000000004 | -2.997 | -0.59 | -0.185 |
| 0.660000000000004 | -2.997 | -0.59 | -0.185 |
| 0.664000000000004 | -2.997 | -0.59 | -0.185 |
| 0.668000000000004 | -2.997 | -0.59 | -0.185 |
| 0.672000000000004 | -2.996 | -0.59 | -0.185 |
| 0.676000000000004 | -2.996 | -0.589 | -0.185 |
| 0.680000000000004 | -2.996 | -0.589 | -0.185 |
| 0.684000000000004 | -2.996 | -0.589 | -0.185 |
| 0.688000000000004 | -2.996 | -0.589 | -0.185 |
| 0.692000000000004 | -2.996 | -0.589 | -0.184 |
| 0.696000000000004 | -2.995 | -0.589 | -0.184 |
| 0.700000000000004 | -2.995 | -0.589 | -0.184 |
| 0.704000000000004 | -2.995 | -0.588 | -0.184 |
| 0.708000000000004 | -2.995 | -0.588 | -0.184 |
| 0.712000000000004 | -2.994 | -0.588 | -0.184 |
| 0.716000000000004 | -2.994 | -0.588 | -0.184 |
| 0.720000000000004 | -2.994 | -0.588 | -0.184 |
| 0.724000000000004 | -2.994 | -0.588 | -0.183 |
| 0.728000000000004 | -2.994 | -0.587 | -0.183 |
| 0.732000000000004 | -2.993 | -0.587 | -0.183 |
| 0.736000000000004 | -2.993 | -0.587 | -0.183 |
| 0.740000000000004 | -2.993 | -0.587 | -0.183 |
| 0.744000000000004 | -2.992 | -0.586 | -0.183 |
| 0.748000000000004 | -2.992 | -0.586 | -0.182 |
| 0.752000000000004 | -2.992 | -0.586 | -0.182 |
| 0.756000000000004 | -2.992 | -0.586 | -0.182 |
| 0.760000000000004 | -2.991 | -0.586 | -0.182 |
| 0.764000000000004 | -2.991 | -0.585 | -0.182 |
| 0.768000000000004 | -2.991 | -0.585 | -0.181 |
| 0.772000000000004 | -2.99 | -0.585 | -0.181 |
| 0.776000000000004 | -2.99 | -0.585 | -0.181 |
| 0.780000000000004 | -2.989 | -0.584 | -0.181 |
| 0.784000000000004 | -2.989 | -0.584 | -0.181 |
| 0.788000000000004 | -2.989 | -0.584 | -0.18 |
| 0.792000000000004 | -2.988 | -0.583 | -0.18 |
| 0.796000000000004 | -2.988 | -0.583 | -0.18 |
| 0.800000000000004 | -2.987 | -0.583 | -0.18 |
| 0.804000000000004 | -2.987 | -0.582 | -0.18 |
| 0.808000000000004 | -2.986 | -0.582 | -0.179 |
| 0.812000000000004 | -2.986 | -0.582 | -0.179 |
| 0.816000000000004 | -2.985 | -0.581 | -0.179 |
| 0.820000000000004 | -2.985 | -0.581 | -0.179 |
| 0.824000000000004 | -2.984 | -0.581 | -0.178 |
| 0.828000000000004 | -2.984 | -0.58 | -0.178 |
| 0.832000000000004 | -2.983 | -0.58 | -0.178 |
| 0.836000000000004 | -2.983 | -0.579 | -0.177 |
| 0.840000000000004 | -2.982 | -0.579 | -0.177 |
| 0.844000000000004 | -2.982 | -0.579 | -0.177 |
| 0.848000000000004 | -2.981 | -0.578 | -0.177 |
| 0.852000000000004 | -2.98 | -0.578 | -0.176 |
| 0.856000000000004 | -2.98 | -0.577 | -0.176 |
| 0.860000000000004 | -2.979 | -0.577 | -0.176 |
| 0.864000000000004 | -2.978 | -0.576 | -0.175 |
| 0.868000000000004 | -2.978 | -0.576 | -0.175 |
| 0.872000000000004 | -2.977 | -0.576 | -0.175 |
| 0.876000000000004 | -2.976 | -0.575 | -0.174 |
| 0.880000000000004 | -2.976 | -0.574 | -0.174 |
| 0.884000000000004 | -2.975 | -0.574 | -0.174 |
| 0.888000000000004 | -2.974 | -0.573 | -0.173 |
| 0.892000000000004 | -2.973 | -0.573 | -0.173 |
| 0.896000000000004 | -2.972 | -0.572 | -0.173 |
| 0.900000000000004 | -2.972 | -0.572 | -0.172 |
| 0.904000000000004 | -2.971 | -0.571 | -0.172 |
| 0.908000000000004 | -2.97 | -0.571 | -0.171 |
| 0.912000000000004 | -2.969 | -0.57 | -0.171 |
| 0.916000000000004 | -2.968 | -0.569 | -0.171 |
| 0.920000000000004 | -2.967 | -0.569 | -0.17 |
| 0.924000000000004 | -2.966 | -0.568 | -0.17 |
| 0.928000000000004 | -2.965 | -0.568 | -0.169 |
| 0.932000000000004 | -2.964 | -0.567 | -0.169 |
| 0.936000000000004 | -2.963 | -0.566 | -0.169 |
| 0.940000000000004 | -2.962 | -0.566 | -0.168 |
| 0.944000000000004 | -2.961 | -0.565 | -0.168 |
| 0.948000000000004 | -2.96 | -0.564 | -0.167 |
| 0.952000000000004 | -2.959 | -0.563 | -0.167 |
| 0.956000000000004 | -2.958 | -0.563 | -0.166 |
| 0.960000000000004 | -2.956 | -0.562 | -0.166 |
| 0.964000000000004 | -2.955 | -0.561 | -0.165 |
| 0.968000000000004 | -2.954 | -0.56 | -0.165 |
| 0.972000000000004 | -2.953 | -0.56 | -0.164 |
| 0.976000000000004 | -2.951 | -0.559 | -0.164 |
| 0.980000000000004 | -2.95 | -0.558 | -0.163 |
| 0.984000000000004 | -2.949 | -0.557 | -0.163 |
| 0.988000000000004 | -2.947 | -0.556 | -0.162 |
| 0.992000000000004 | -2.946 | -0.555 | -0.162 |
| 0.996000000000004 | -2.944 | -0.555 | -0.161 |
| 1.000000000000004 | -2.943 | -0.554 | -0.161 |
| 1.004000000000004 | -2.942 | -0.553 | -0.16 |
| 1.008000000000004 | -2.94 | -0.552 | -0.16 |
| 1.012000000000004 | -2.938 | -0.551 | -0.159 |
| 1.016000000000004 | -2.937 | -0.55 | -0.158 |
| 1.020000000000004 | -2.935 | -0.549 | -0.158 |
| 1.024000000000004 | -2.934 | -0.548 | -0.157 |
| 1.028000000000004 | -2.932 | -0.547 | -0.157 |
| 1.032000000000004 | -2.93 | -0.546 | -0.156 |
| 1.036000000000004 | -2.929 | -0.545 | -0.156 |
| 1.040000000000004 | -2.927 | -0.544 | -0.155 |
| 1.044000000000004 | -2.925 | -0.543 | -0.154 |
| 1.048000000000004 | -2.923 | -0.542 | -0.154 |
| 1.052000000000004 | -2.921 | -0.541 | -0.153 |
| 1.056000000000004 | -2.919 | -0.54 | -0.153 |
| 1.060000000000004 | -2.917 | -0.539 | -0.152 |
| 1.064000000000004 | -2.915 | -0.538 | -0.151 |
| 1.068000000000004 | -2.913 | -0.536 | -0.151 |
| 1.072000000000004 | -2.911 | -0.535 | -0.15 |
| 1.076000000000004 | -2.909 | -0.534 | -0.149 |
| 1.080000000000004 | -2.907 | -0.533 | -0.149 |
| 1.084000000000004 | -2.905 | -0.532 | -0.148 |
| 1.088000000000004 | -2.903 | -0.53 | -0.147 |
| 1.092000000000004 | -2.901 | -0.529 | -0.147 |
| 1.096000000000004 | -2.898 | -0.528 | -0.146 |
| 1.100000000000004 | -2.896 | -0.527 | -0.145 |
| 1.104000000000004 | -2.894 | -0.525 | -0.145 |
| 1.108000000000004 | -2.891 | -0.524 | -0.144 |
| 1.112000000000004 | -2.889 | -0.523 | -0.143 |
| 1.116000000000004 | -2.886 | -0.522 | -0.142 |
| 1.120000000000004 | -2.884 | -0.52 | -0.142 |
| 1.124000000000004 | -2.881 | -0.519 | -0.141 |
| 1.128000000000004 | -2.879 | -0.517 | -0.14 |
| 1.132000000000004 | -2.876 | -0.516 | -0.14 |
| 1.136000000000004 | -2.874 | -0.515 | -0.139 |
| 1.140000000000004 | -2.871 | -0.513 | -0.138 |
| 1.144000000000004 | -2.868 | -0.512 | -0.137 |
| 1.148000000000004 | -2.865 | -0.51 | -0.137 |
| 1.152000000000004 | -2.862 | -0.509 | -0.136 |
| 1.156000000000004 | -2.86 | -0.507 | -0.135 |
| 1.160000000000004 | -2.857 | -0.506 | -0.134 |
| 1.164000000000004 | -2.854 | -0.504 | -0.133 |
| 1.168000000000004 | -2.851 | -0.503 | -0.133 |
| 1.172000000000004 | -2.848 | -0.501 | -0.132 |
| 1.176000000000004 | -2.845 | -0.5 | -0.131 |
| 1.180000000000004 | -2.841 | -0.498 | -0.13 |
| 1.184000000000004 | -2.838 | -0.497 | -0.13 |
| 1.188000000000004 | -2.835 | -0.495 | -0.129 |
| 1.192000000000004 | -2.832 | -0.493 | -0.128 |
| 1.196000000000004 | -2.828 | -0.492 | -0.127 |
| 1.200000000000004 | -2.825 | -0.49 | -0.126 |
| 1.204000000000004 | -2.822 | -0.489 | -0.126 |
| 1.208000000000004 | -2.818 | -0.487 | -0.125 |
| 1.212000000000004 | -2.815 | -0.485 | -0.124 |
| 1.216000000000004 | -2.811 | -0.483 | -0.123 |
| 1.220000000000004 | -2.807 | -0.482 | -0.122 |
| 1.224000000000004 | -2.804 | -0.48 | -0.122 |
| 1.228000000000004 | -2.8 | -0.478 | -0.121 |
| 1.232000000000004 | -2.796 | -0.476 | -0.12 |
| 1.236000000000004 | -2.793 | -0.475 | -0.119 |
| 1.240000000000004 | -2.789 | -0.473 | -0.118 |
| 1.244000000000004 | -2.785 | -0.471 | -0.117 |
| 1.248000000000004 | -2.781 | -0.469 | -0.117 |
| 1.252000000000004 | -2.777 | -0.467 | -0.116 |
| 1.256000000000004 | -2.773 | -0.466 | -0.115 |
| 1.260000000000004 | -2.769 | -0.464 | -0.114 |
| 1.264000000000004 | -2.765 | -0.462 | -0.113 |
| 1.268000000000004 | -2.76 | -0.46 | -0.112 |
| 1.272000000000004 | -2.756 | -0.458 | -0.111 |
| 1.276000000000004 | -2.752 | -0.456 | -0.111 |
| 1.280000000000004 | -2.747 | -0.454 | -0.11 |
| 1.284000000000004 | -2.743 | -0.452 | -0.109 |
| 1.288000000000004 | -2.739 | -0.45 | -0.108 |
| 1.292000000000004 | -2.734 | -0.448 | -0.107 |
| 1.296000000000004 | -2.73 | -0.446 | -0.106 |
| 1.300000000000004 | -2.725 | -0.444 | -0.106 |
| 1.304000000000004 | -2.72 | -0.442 | -0.105 |
| 1.308000000000004 | -2.716 | -0.44 | -0.104 |
| 1.312000000000004 | -2.711 | -0.438 | -0.103 |
| 1.316000000000004 | -2.706 | -0.436 | -0.102 |
| 1.320000000000004 | -2.701 | -0.434 | -0.101 |
| 1.324000000000004 | -2.696 | -0.432 | -0.1 |
| 1.328000000000004 | -2.691 | -0.43 | -0.1 |
| 1.332000000000004 | -2.686 | -0.428 | -0.099 |
| 1.336000000000004 | -2.681 | -0.426 | -0.098 |
| 1.340000000000004 | -2.676 | -0.424 | -0.097 |
| 1.344000000000004 | -2.671 | -0.422 | -0.096 |
| 1.348000000000004 | -2.666 | -0.42 | -0.095 |
| 1.352000000000004 | -2.66 | -0.418 | -0.094 |
| 1.356000000000004 | -2.655 | -0.416 | -0.094 |
| 1.360000000000004 | -2.65 | -0.413 | -0.093 |
| 1.364000000000004 | -2.644 | -0.411 | -0.092 |
| 1.368000000000004 | -2.639 | -0.409 | -0.091 |
| 1.372000000000004 | -2.633 | -0.407 | -0.09 |
| 1.376000000000004 | -2.627 | -0.405 | -0.089 |
| 1.380000000000004 | -2.622 | -0.403 | -0.088 |
| 1.384000000000004 | -2.616 | -0.4 | -0.088 |
| 1.388000000000005 | -2.61 | -0.398 | -0.087 |
| 1.392000000000004 | -2.605 | -0.396 | -0.086 |
| 1.396000000000004 | -2.599 | -0.394 | -0.085 |
| 1.400000000000005 | -2.593 | -0.392 | -0.084 |
| 1.404000000000005 | -2.587 | -0.389 | -0.083 |
| 1.408000000000005 | -2.581 | -0.387 | -0.083 |
| 1.412000000000005 | -2.575 | -0.385 | -0.082 |
| 1.416000000000005 | -2.569 | -0.383 | -0.081 |
| 1.420000000000005 | -2.562 | -0.38 | -0.08 |
| 1.424000000000005 | -2.556 | -0.378 | -0.079 |
| 1.428000000000005 | -2.55 | -0.376 | -0.078 |
| 1.432000000000005 | -2.544 | -0.373 | -0.078 |
| 1.436000000000005 | -2.537 | -0.371 | -0.077 |
| 1.440000000000005 | -2.531 | -0.369 | -0.076 |
| 1.444000000000005 | -2.524 | -0.367 | -0.075 |
| 1.448000000000005 | -2.518 | -0.364 | -0.074 |
| 1.452000000000005 | -2.511 | -0.362 | -0.074 |
| 1.456000000000005 | -2.505 | -0.36 | -0.073 |
| 1.460000000000005 | -2.498 | -0.357 | -0.072 |
| 1.464000000000005 | -2.491 | -0.355 | -0.071 |
| 1.468000000000005 | -2.484 | -0.353 | -0.07 |
| 1.472000000000005 | -2.478 | -0.35 | -0.07 |
| 1.476000000000005 | -2.471 | -0.348 | -0.069 |
| 1.480000000000005 | -2.464 | -0.346 | -0.068 |
| 1.484000000000005 | -2.457 | -0.343 | -0.067 |
| 1.488000000000005 | -2.45 | -0.341 | -0.066 |
| 1.492000000000005 | -2.443 | -0.339 | -0.066 |
| 1.496000000000005 | -2.435 | -0.336 | -0.065 |
| 1.500000000000005 | -2.428 | -0.334 | -0.064 |
| 1.504000000000005 | -2.421 | -0.332 | -0.063 |
| 1.508000000000005 | -2.414 | -0.329 | -0.063 |
| 1.512000000000005 | -2.406 | -0.327 | -0.062 |
| 1.516000000000005 | -2.399 | -0.325 | -0.061 |
| 1.520000000000005 | -2.392 | -0.322 | -0.06 |
| 1.524000000000005 | -2.384 | -0.32 | -0.06 |
| 1.528000000000005 | -2.377 | -0.318 | -0.059 |
| 1.532000000000005 | -2.369 | -0.315 | -0.058 |
| 1.536000000000005 | -2.362 | -0.313 | -0.058 |
| 1.540000000000005 | -2.354 | -0.311 | -0.057 |
| 1.544000000000005 | -2.346 | -0.308 | -0.056 |
| 1.548000000000005 | -2.338 | -0.306 | -0.055 |
| 1.552000000000005 | -2.331 | -0.304 | -0.055 |
| 1.556000000000005 | -2.323 | -0.301 | -0.054 |
| 1.560000000000005 | -2.315 | -0.299 | -0.053 |
| 1.564000000000005 | -2.307 | -0.297 | -0.053 |
| 1.568000000000005 | -2.299 | -0.294 | -0.052 |
| 1.572000000000005 | -2.291 | -0.292 | -0.051 |
| 1.576000000000005 | -2.283 | -0.29 | -0.051 |
| 1.580000000000005 | -2.275 | -0.287 | -0.05 |
| 1.584000000000005 | -2.267 | -0.285 | -0.049 |
| 1.588000000000005 | -2.259 | -0.283 | -0.049 |
| 1.592000000000005 | -2.251 | -0.28 | -0.048 |
| 1.596000000000005 | -2.242 | -0.278 | -0.047 |
| 1.600000000000005 | -2.234 | -0.276 | -0.047 |
| 1.604000000000005 | -2.226 | -0.273 | -0.046 |
| 1.608000000000005 | -2.217 | -0.271 | -0.045 |
| 1.612000000000005 | -2.209 | -0.269 | -0.045 |
| 1.616000000000005 | -2.201 | -0.267 | -0.044 |
| 1.620000000000005 | -2.192 | -0.264 | -0.043 |
| 1.624000000000005 | -2.184 | -0.262 | -0.043 |
| 1.628000000000005 | -2.175 | -0.26 | -0.042 |
| 1.632000000000005 | -2.166 | -0.257 | -0.042 |
| 1.636000000000005 | -2.158 | -0.255 | -0.041 |
| 1.640000000000005 | -2.149 | -0.253 | -0.04 |
| 1.644000000000005 | -2.14 | -0.251 | -0.04 |
| 1.648000000000005 | -2.132 | -0.248 | -0.039 |
| 1.652000000000005 | -2.123 | -0.246 | -0.039 |
| 1.656000000000005 | -2.114 | -0.244 | -0.038 |
| 1.660000000000005 | -2.105 | -0.242 | -0.038 |
| 1.664000000000005 | -2.097 | -0.239 | -0.037 |
| 1.668000000000005 | -2.088 | -0.237 | -0.036 |
| 1.672000000000005 | -2.079 | -0.235 | -0.036 |
| 1.676000000000005 | -2.07 | -0.233 | -0.035 |
| 1.680000000000005 | -2.061 | -0.231 | -0.035 |
| 1.684000000000005 | -2.052 | -0.228 | -0.034 |
| 1.688000000000005 | -2.043 | -0.226 | -0.034 |
| 1.692000000000005 | -2.034 | -0.224 | -0.033 |
| 1.696000000000005 | -2.025 | -0.222 | -0.033 |
| 1.700000000000005 | -2.016 | -0.22 | -0.032 |
| 1.704000000000005 | -2.006 | -0.218 | -0.032 |
| 1.708000000000005 | -1.997 | -0.216 | -0.031 |
| 1.712000000000005 | -1.988 | -0.213 | -0.031 |
| 1.716000000000005 | -1.979 | -0.211 | -0.03 |
| 1.720000000000005 | -1.97 | -0.209 | -0.03 |
| 1.724000000000005 | -1.96 | -0.207 | -0.029 |
| 1.728000000000005 | -1.951 | -0.205 | -0.029 |
| 1.732000000000005 | -1.942 | -0.203 | -0.028 |
| 1.736000000000005 | -1.932 | -0.201 | -0.028 |
| 1.740000000000005 | -1.923 | -0.199 | -0.027 |
| 1.744000000000005 | -1.914 | -0.197 | -0.027 |
| 1.748000000000005 | -1.904 | -0.195 | -0.027 |
| 1.752000000000005 | -1.895 | -0.193 | -0.026 |
| 1.756000000000005 | -1.886 | -0.191 | -0.026 |
| 1.760000000000005 | -1.876 | -0.189 | -0.025 |
| 1.764000000000005 | -1.867 | -0.187 | -0.025 |
| 1.768000000000005 | -1.857 | -0.185 | -0.024 |
| 1.772000000000005 | -1.848 | -0.183 | -0.024 |
| 1.776000000000005 | -1.838 | -0.181 | -0.024 |
| 1.780000000000005 | -1.829 | -0.179 | -0.023 |
| 1.784000000000005 | -1.819 | -0.177 | -0.023 |
| 1.788000000000005 | -1.81 | -0.175 | -0.022 |
| 1.792000000000005 | -1.8 | -0.173 | -0.022 |
| 1.796000000000005 | -1.79 | -0.171 | -0.022 |
| 1.800000000000005 | -1.781 | -0.169 | -0.021 |
| 1.804000000000005 | -1.771 | -0.167 | -0.021 |
| 1.808000000000005 | -1.762 | -0.165 | -0.02 |
| 1.812000000000005 | -1.752 | -0.163 | -0.02 |
| 1.816000000000005 | -1.742 | -0.162 | -0.02 |
| 1.820000000000005 | -1.733 | -0.16 | -0.019 |
| 1.824000000000005 | -1.723 | -0.158 | -0.019 |
| 1.828000000000005 | -1.714 | -0.156 | -0.019 |
| 1.832000000000005 | -1.704 | -0.154 | -0.018 |
| 1.836000000000005 | -1.694 | -0.152 | -0.018 |
| 1.840000000000005 | -1.685 | -0.151 | -0.018 |
| 1.844000000000005 | -1.675 | -0.149 | -0.017 |
| 1.848000000000005 | -1.665 | -0.147 | -0.017 |
| 1.852000000000005 | -1.655 | -0.145 | -0.017 |
| 1.856000000000005 | -1.646 | -0.144 | -0.016 |
| 1.860000000000005 | -1.636 | -0.142 | -0.016 |
| 1.864000000000005 | -1.626 | -0.14 | -0.016 |
| 1.868000000000005 | -1.617 | -0.138 | -0.016 |
| 1.872000000000005 | -1.607 | -0.137 | -0.015 |
| 1.876000000000005 | -1.597 | -0.135 | -0.015 |
| 1.880000000000005 | -1.588 | -0.133 | -0.015 |
| 1.884000000000005 | -1.578 | -0.132 | -0.014 |
| 1.888000000000005 | -1.568 | -0.13 | -0.014 |
| 1.892000000000005 | -1.559 | -0.129 | -0.014 |
| 1.896000000000005 | -1.549 | -0.127 | -0.014 |
| 1.900000000000005 | -1.539 | -0.125 | -0.013 |
| 1.904000000000005 | -1.53 | -0.124 | -0.013 |
| 1.908000000000005 | -1.52 | -0.122 | -0.013 |
| 1.912000000000005 | -1.51 | -0.121 | -0.013 |
| 1.916000000000005 | -1.501 | -0.119 | -0.012 |
| 1.920000000000005 | -1.491 | -0.118 | -0.012 |
| 1.924000000000005 | -1.481 | -0.116 | -0.012 |
| 1.928000000000005 | -1.472 | -0.115 | -0.012 |
| 1.932000000000005 | -1.462 | -0.113 | -0.011 |
| 1.936000000000005 | -1.452 | -0.112 | -0.011 |
| 1.940000000000005 | -1.443 | -0.11 | -0.011 |
| 1.944000000000005 | -1.433 | -0.109 | -0.011 |
| 1.948000000000005 | -1.424 | -0.107 | -0.01 |
| 1.952000000000005 | -1.414 | -0.106 | -0.01 |
| 1.956000000000005 | -1.405 | -0.104 | -0.01 |
| 1.960000000000005 | -1.395 | -0.103 | -0.01 |
| 1.964000000000005 | -1.386 | -0.102 | -0.01 |
| 1.968000000000005 | -1.376 | -0.1 | -0.009 |
| 1.972000000000005 | -1.366 | -0.099 | -0.009 |
| 1.976000000000005 | -1.357 | -0.097 | -0.009 |
| 1.980000000000005 | -1.348 | -0.096 | -0.009 |
| 1.984000000000005 | -1.338 | -0.095 | -0.009 |
| 1.988000000000005 | -1.329 | -0.093 | -0.008 |
| 1.992000000000005 | -1.319 | -0.092 | -0.008 |
| 1.996000000000005 | -1.31 | -0.091 | -0.008 |
| 2.000000000000005 | -1.3 | -0.09 | -0.008 |
| 2.004000000000005 | -1.291 | -0.088 | -0.008 |
| 2.008000000000005 | -1.282 | -0.087 | -0.008 |
| 2.012000000000005 | -1.272 | -0.086 | -0.007 |
| 2.016000000000005 | -1.263 | -0.085 | -0.007 |
| 2.020000000000005 | -1.254 | -0.083 | -0.007 |
| 2.024000000000005 | -1.245 | -0.082 | -0.007 |
| 2.028000000000005 | -1.235 | -0.081 | -0.007 |
| 2.032000000000005 | -1.226 | -0.08 | -0.007 |
| 2.036000000000005 | -1.217 | -0.079 | -0.007 |
| 2.040000000000005 | -1.208 | -0.078 | -0.006 |
| 2.044000000000005 | -1.199 | -0.076 | -0.006 |
| 2.048000000000005 | -1.189 | -0.075 | -0.006 |
| 2.052000000000005 | -1.18 | -0.074 | -0.006 |
| 2.056000000000005 | -1.171 | -0.073 | -0.006 |
| 2.060000000000005 | -1.162 | -0.072 | -0.006 |
| 2.064000000000005 | -1.153 | -0.071 | -0.006 |
| 2.068000000000005 | -1.144 | -0.07 | -0.005 |
| 2.072000000000005 | -1.135 | -0.069 | -0.005 |
| 2.076000000000005 | -1.126 | -0.068 | -0.005 |
| 2.080000000000005 | -1.117 | -0.067 | -0.005 |
| 2.084000000000005 | -1.108 | -0.066 | -0.005 |
| 2.088000000000005 | -1.1 | -0.065 | -0.005 |
| 2.092000000000005 | -1.091 | -0.064 | -0.005 |
| 2.096000000000005 | -1.082 | -0.063 | -0.005 |
| 2.100000000000005 | -1.073 | -0.062 | -0.005 |
| 2.104000000000005 | -1.064 | -0.061 | -0.004 |
| 2.108000000000005 | -1.056 | -0.06 | -0.004 |
| 2.112000000000005 | -1.047 | -0.059 | -0.004 |
| 2.116000000000005 | -1.038 | -0.058 | -0.004 |
| 2.120000000000005 | -1.03 | -0.057 | -0.004 |
| 2.124000000000005 | -1.021 | -0.056 | -0.004 |
| 2.128000000000005 | -1.013 | -0.055 | -0.004 |
| 2.132000000000005 | -1.004 | -0.054 | -0.004 |
| 2.136000000000005 | -0.996 | -0.054 | -0.004 |
| 2.140000000000005 | -0.987 | -0.053 | -0.004 |
| 2.144000000000005 | -0.979 | -0.052 | -0.003 |
| 2.148000000000005 | -0.97 | -0.051 | -0.003 |
| 2.152000000000005 | -0.962 | -0.05 | -0.003 |
| 2.156000000000005 | -0.954 | -0.049 | -0.003 |
| 2.160000000000005 | -0.945 | -0.049 | -0.003 |
| 2.164000000000005 | -0.937 | -0.048 | -0.003 |
| 2.168000000000005 | -0.929 | -0.047 | -0.003 |
| 2.172000000000005 | -0.921 | -0.046 | -0.003 |
| 2.176000000000005 | -0.913 | -0.045 | -0.003 |
| 2.180000000000005 | -0.905 | -0.045 | -0.003 |
| 2.184000000000005 | -0.896 | -0.044 | -0.003 |
| 2.188000000000005 | -0.888 | -0.043 | -0.003 |
| 2.192000000000005 | -0.88 | -0.042 | -0.003 |
| 2.196000000000005 | -0.873 | -0.042 | -0.003 |
| 2.200000000000005 | -0.865 | -0.041 | -0.002 |
| 2.204000000000005 | -0.857 | -0.04 | -0.002 |
| 2.208000000000005 | -0.849 | -0.04 | -0.002 |
| 2.212000000000005 | -0.841 | -0.039 | -0.002 |
| 2.216000000000005 | -0.833 | -0.038 | -0.002 |
| 2.220000000000005 | -0.826 | -0.038 | -0.002 |
| 2.224000000000005 | -0.818 | -0.037 | -0.002 |
| 2.228000000000005 | -0.81 | -0.036 | -0.002 |
| 2.232000000000005 | -0.803 | -0.036 | -0.002 |
| 2.236000000000005 | -0.795 | -0.035 | -0.002 |
| 2.240000000000005 | -0.788 | -0.034 | -0.002 |
| 2.244000000000005 | -0.78 | -0.034 | -0.002 |
| 2.248000000000005 | -0.773 | -0.033 | -0.002 |
| 2.252000000000005 | -0.765 | -0.033 | -0.002 |
| 2.256000000000005 | -0.758 | -0.032 | -0.002 |
| 2.260000000000005 | -0.751 | -0.032 | -0.002 |
| 2.264000000000005 | -0.743 | -0.031 | -0.002 |
| 2.268000000000005 | -0.736 | -0.03 | -0.002 |
| 2.272000000000005 | -0.729 | -0.03 | -0.002 |
| 2.276000000000005 | -0.722 | -0.029 | -0.001 |
| 2.280000000000005 | -0.715 | -0.029 | -0.001 |
| 2.284000000000005 | -0.708 | -0.028 | -0.001 |
| 2.288000000000005 | -0.701 | -0.028 | -0.001 |
| 2.292000000000005 | -0.694 | -0.027 | -0.001 |
| 2.296000000000005 | -0.687 | -0.027 | -0.001 |
| 2.300000000000005 | -0.68 | -0.026 | -0.001 |
| 2.304000000000005 | -0.673 | -0.026 | -0.001 |
| 2.308000000000005 | -0.666 | -0.025 | -0.001 |
| 2.312000000000005 | -0.66 | -0.025 | -0.001 |
| 2.316000000000005 | -0.653 | -0.024 | -0.001 |
| 2.320000000000005 | -0.646 | -0.024 | -0.001 |
| 2.324000000000005 | -0.64 | -0.023 | -0.001 |
| 2.328000000000005 | -0.633 | -0.023 | -0.001 |
| 2.332000000000005 | -0.626 | -0.023 | -0.001 |
| 2.336000000000005 | -0.62 | -0.022 | -0.001 |
| 2.340000000000005 | -0.613 | -0.022 | -0.001 |
| 2.344000000000005 | -0.607 | -0.021 | -0.001 |
| 2.348000000000005 | -0.601 | -0.021 | -0.001 |
| 2.352000000000005 | -0.594 | -0.021 | -0.001 |
| 2.356000000000005 | -0.588 | -0.02 | -0.001 |
| 2.360000000000005 | -0.582 | -0.02 | -0.001 |
| 2.364000000000005 | -0.576 | -0.019 | -0.001 |
| 2.368000000000005 | -0.569 | -0.019 | -0.001 |
| 2.372000000000005 | -0.563 | -0.019 | -0.001 |
| 2.376000000000005 | -0.557 | -0.018 | -0.001 |
| 2.380000000000005 | -0.551 | -0.018 | -0.001 |
| 2.384000000000005 | -0.545 | -0.018 | -0.001 |
| 2.388000000000005 | -0.539 | -0.017 | -0.001 |
| 2.392000000000005 | -0.533 | -0.017 | -0.001 |
| 2.396000000000005 | -0.528 | -0.017 | -0.001 |
| 2.400000000000005 | -0.522 | -0.016 | -0.001 |
| 2.404000000000005 | -0.516 | -0.016 | -0.001 |
| 2.408000000000005 | -0.51 | -0.016 | -0.001 |
| 2.412000000000005 | -0.505 | -0.015 | -0.001 |
| 2.416000000000005 | -0.499 | -0.015 | -0.001 |
| 2.420000000000005 | -0.493 | -0.015 | -0.001 |
| 2.424000000000005 | -0.488 | -0.014 | -0.001 |
| 2.428000000000005 | -0.482 | -0.014 | -0.001 |
| 2.432000000000005 | -0.477 | -0.014 | 0 |
| 2.436000000000005 | -0.472 | -0.013 | 0 |
| 2.440000000000005 | -0.466 | -0.013 | 0 |
| 2.444000000000005 | -0.461 | -0.013 | 0 |
| 2.448000000000005 | -0.456 | -0.013 | 0 |
| 2.452000000000005 | -0.45 | -0.012 | 0 |
| 2.456000000000005 | -0.445 | -0.012 | 0 |
| 2.460000000000005 | -0.44 | -0.012 | 0 |
| 2.464000000000005 | -0.435 | -0.012 | 0 |
| 2.468000000000005 | -0.43 | -0.011 | 0 |
| 2.472000000000005 | -0.425 | -0.011 | 0 |
| 2.476000000000005 | -0.42 | -0.011 | 0 |
| 2.480000000000005 | -0.415 | -0.011 | 0 |
| 2.484000000000005 | -0.41 | -0.01 | 0 |
| 2.488000000000005 | -0.405 | -0.01 | 0 |
| 2.492000000000005 | -0.4 | -0.01 | 0 |
| 2.496000000000005 | -0.395 | -0.01 | 0 |
| 2.500000000000005 | -0.391 | -0.01 | 0 |
| 2.504000000000005 | -0.386 | -0.009 | 0 |
| 2.508000000000005 | -0.381 | -0.009 | 0 |
| 2.512000000000005 | -0.377 | -0.009 | 0 |
| 2.516000000000005 | -0.372 | -0.009 | 0 |
| 2.520000000000005 | -0.368 | -0.009 | 0 |
| 2.524000000000005 | -0.363 | -0.008 | 0 |
| 2.528000000000005 | -0.359 | -0.008 | 0 |
| 2.532000000000005 | -0.354 | -0.008 | 0 |
| 2.536000000000005 | -0.35 | -0.008 | 0 |
| 2.540000000000005 | -0.346 | -0.008 | 0 |
| 2.544000000000005 | -0.341 | -0.008 | 0 |
| 2.548000000000005 | -0.337 | -0.007 | 0 |
| 2.552000000000005 | -0.333 | -0.007 | 0 |
| 2.556000000000005 | -0.329 | -0.007 | 0 |
| 2.560000000000005 | -0.325 | -0.007 | 0 |
| 2.564000000000005 | -0.321 | -0.007 | 0 |
| 2.568000000000005 | -0.317 | -0.007 | 0 |
| 2.572000000000005 | -0.312 | -0.006 | 0 |
| 2.576000000000005 | -0.309 | -0.006 | 0 |
| 2.580000000000005 | -0.305 | -0.006 | 0 |
| 2.584000000000005 | -0.301 | -0.006 | 0 |
| 2.588000000000005 | -0.297 | -0.006 | 0 |
| 2.592000000000005 | -0.293 | -0.006 | 0 |
| 2.596000000000005 | -0.289 | -0.006 | 0 |
| 2.600000000000005 | -0.285 | -0.006 | 0 |
| 2.604000000000005 | -0.282 | -0.005 | 0 |
| 2.608000000000005 | -0.278 | -0.005 | 0 |
| 2.612000000000005 | -0.274 | -0.005 | 0 |
| 2.616000000000005 | -0.271 | -0.005 | 0 |
| 2.620000000000005 | -0.267 | -0.005 | 0 |
| 2.624000000000005 | -0.264 | -0.005 | 0 |
| 2.628000000000005 | -0.26 | -0.005 | 0 |
| 2.632000000000005 | -0.257 | -0.005 | 0 |
| 2.636000000000005 | -0.253 | -0.004 | 0 |
| 2.640000000000005 | -0.25 | -0.004 | 0 |
| 2.644000000000005 | -0.247 | -0.004 | 0 |
| 2.648000000000005 | -0.243 | -0.004 | 0 |
| 2.652000000000005 | -0.24 | -0.004 | 0 |
| 2.656000000000005 | -0.237 | -0.004 | 0 |
| 2.660000000000005 | -0.234 | -0.004 | 0 |
| 2.664000000000005 | -0.231 | -0.004 | 0 |
| 2.668000000000005 | -0.227 | -0.004 | 0 |
| 2.672000000000005 | -0.224 | -0.004 | 0 |
| 2.676000000000005 | -0.221 | -0.004 | 0 |
| 2.680000000000005 | -0.218 | -0.003 | 0 |
| 2.684000000000005 | -0.215 | -0.003 | 0 |
| 2.688000000000005 | -0.212 | -0.003 | 0 |
| 2.692000000000005 | -0.209 | -0.003 | 0 |
| 2.696000000000005 | -0.206 | -0.003 | 0 |
| 2.700000000000005 | -0.204 | -0.003 | 0 |
| 2.704000000000005 | -0.201 | -0.003 | 0 |
| 2.708000000000005 | -0.198 | -0.003 | 0 |
| 2.712000000000005 | -0.195 | -0.003 | 0 |
| 2.716000000000005 | -0.192 | -0.003 | 0 |
| 2.720000000000005 | -0.19 | -0.003 | 0 |
| 2.724000000000005 | -0.187 | -0.003 | 0 |
| 2.728000000000005 | -0.184 | -0.003 | 0 |
| 2.732000000000005 | -0.182 | -0.003 | 0 |
| 2.736000000000005 | -0.179 | -0.002 | 0 |
| 2.740000000000005 | -0.177 | -0.002 | 0 |
| 2.744000000000005 | -0.174 | -0.002 | 0 |
| 2.748000000000005 | -0.172 | -0.002 | 0 |
| 2.752000000000005 | -0.169 | -0.002 | 0 |
| 2.756000000000005 | -0.167 | -0.002 | 0 |
| 2.760000000000005 | -0.164 | -0.002 | 0 |
| 2.764000000000005 | -0.162 | -0.002 | 0 |
| 2.768000000000005 | -0.159 | -0.002 | 0 |
| 2.772000000000005 | -0.157 | -0.002 | 0 |
| 2.776000000000005 | -0.155 | -0.002 | 0 |
| 2.780000000000005 | -0.153 | -0.002 | 0 |
| 2.784000000000005 | -0.15 | -0.002 | 0 |
| 2.788000000000006 | -0.148 | -0.002 | 0 |
| 2.792000000000005 | -0.146 | -0.002 | 0 |
| 2.796000000000005 | -0.144 | -0.002 | 0 |
| 2.800000000000006 | -0.142 | -0.002 | 0 |
| 2.804000000000006 | -0.139 | -0.002 | 0 |
| 2.808000000000006 | -0.137 | -0.002 | 0 |
| 2.812000000000006 | -0.135 | -0.002 | 0 |
| 2.816000000000006 | -0.133 | -0.001 | 0 |
| 2.820000000000006 | -0.131 | -0.001 | 0 |
| 2.824000000000006 | -0.129 | -0.001 | 0 |
| 2.828000000000006 | -0.127 | -0.001 | 0 |
| 2.832000000000006 | -0.125 | -0.001 | 0 |
| 2.836000000000006 | -0.124 | -0.001 | 0 |
| 2.840000000000006 | -0.122 | -0.001 | 0 |
| 2.844000000000006 | -0.12 | -0.001 | 0 |
| 2.848000000000006 | -0.118 | -0.001 | 0 |
| 2.852000000000006 | -0.116 | -0.001 | 0 |
| 2.856000000000006 | -0.114 | -0.001 | 0 |
| 2.860000000000006 | -0.113 | -0.001 | 0 |
| 2.864000000000006 | -0.111 | -0.001 | 0 |
| 2.868000000000006 | -0.109 | -0.001 | 0 |
| 2.872000000000006 | -0.107 | -0.001 | 0 |
| 2.876000000000006 | -0.106 | -0.001 | 0 |
| 2.880000000000006 | -0.104 | -0.001 | 0 |
| 2.884000000000006 | -0.102 | -0.001 | 0 |
| 2.888000000000006 | -0.101 | -0.001 | 0 |
| 2.892000000000006 | -0.099 | -0.001 | 0 |
| 2.896000000000006 | -0.098 | -0.001 | 0 |
| 2.900000000000006 | -0.096 | -0.001 | 0 |
| 2.904000000000006 | -0.095 | -0.001 | 0 |
| 2.908000000000006 | -0.093 | -0.001 | 0 |
| 2.912000000000006 | -0.092 | -0.001 | 0 |
| 2.916000000000006 | -0.09 | -0.001 | 0 |
| 2.920000000000006 | -0.089 | -0.001 | 0 |
| 2.924000000000006 | -0.087 | -0.001 | 0 |
| 2.928000000000006 | -0.086 | -0.001 | 0 |
| 2.932000000000006 | -0.084 | -0.001 | 0 |
| 2.936000000000006 | -0.083 | -0.001 | 0 |
| 2.940000000000006 | -0.082 | -0.001 | 0 |
| 2.944000000000006 | -0.08 | -0.001 | 0 |
| 2.948000000000006 | -0.079 | -0.001 | 0 |
| 2.952000000000006 | -0.078 | -0.001 | 0 |
| 2.956000000000006 | -0.077 | -0.001 | 0 |
| 2.960000000000006 | -0.075 | -0.001 | 0 |
| 2.964000000000006 | -0.074 | -0.001 | 0 |
| 2.968000000000006 | -0.073 | -0.001 | 0 |
| 2.972000000000006 | -0.072 | -0.001 | 0 |
| 2.976000000000006 | -0.07 | 0 | 0 |
| 2.980000000000006 | -0.069 | 0 | 0 |
| 2.984000000000006 | -0.068 | 0 | 0 |
| 2.988000000000006 | -0.067 | 0 | 0 |
| 2.992000000000006 | -0.066 | 0 | 0 |
| 2.996000000000006 | -0.065 | 0 | 0 |
| 3.000000000000006 | -0.064 | 0 | 0 |
| 3.004000000000006 | -0.063 | 0 | 0 |
| 3.008000000000006 | -0.062 | 0 | 0 |
| 3.012000000000006 | -0.061 | 0 | 0 |
| 3.016000000000006 | -0.059 | 0 | 0 |
| 3.020000000000006 | -0.058 | 0 | 0 |
| 3.024000000000006 | -0.057 | 0 | 0 |
| 3.028000000000006 | -0.056 | 0 | 0 |
| 3.032000000000006 | -0.056 | 0 | 0 |
| 3.036000000000006 | -0.055 | 0 | 0 |
| 3.040000000000006 | -0.054 | 0 | 0 |
| 3.044000000000006 | -0.053 | 0 | 0 |
| 3.048000000000006 | -0.052 | 0 | 0 |
| 3.052000000000006 | -0.051 | 0 | 0 |
| 3.056000000000006 | -0.05 | 0 | 0 |
| 3.060000000000006 | -0.049 | 0 | 0 |
| 3.064000000000006 | -0.048 | 0 | 0 |
| 3.068000000000006 | -0.047 | 0 | 0 |
| 3.072000000000006 | -0.047 | 0 | 0 |
| 3.076000000000006 | -0.046 | 0 | 0 |
| 3.080000000000006 | -0.045 | 0 | 0 |
| 3.084000000000006 | -0.044 | 0 | 0 |
| 3.088000000000006 | -0.043 | 0 | 0 |
| 3.092000000000006 | -0.043 | 0 | 0 |
| 3.096000000000006 | -0.042 | 0 | 0 |
| 3.100000000000006 | -0.041 | 0 | 0 |
| 3.104000000000006 | -0.04 | 0 | 0 |
| 3.108000000000006 | -0.04 | 0 | 0 |
| 3.112000000000006 | -0.039 | 0 | 0 |
| 3.116000000000006 | -0.038 | 0 | 0 |
| 3.120000000000006 | -0.038 | 0 | 0 |
| 3.124000000000006 | -0.037 | 0 | 0 |
| 3.128000000000006 | -0.036 | 0 | 0 |
| 3.132000000000006 | -0.036 | 0 | 0 |
| 3.136000000000006 | -0.035 | 0 | 0 |
| 3.140000000000006 | -0.034 | 0 | 0 |
| 3.144000000000006 | -0.034 | 0 | 0 |
| 3.148000000000006 | -0.033 | 0 | 0 |
| 3.152000000000006 | -0.033 | 0 | 0 |
| 3.156000000000006 | -0.032 | 0 | 0 |
| 3.160000000000006 | -0.031 | 0 | 0 |
| 3.164000000000006 | -0.031 | 0 | 0 |
| 3.168000000000006 | -0.03 | 0 | 0 |
| 3.172000000000006 | -0.03 | 0 | 0 |
| 3.176000000000006 | -0.029 | 0 | 0 |
| 3.180000000000006 | -0.029 | 0 | 0 |
| 3.184000000000006 | -0.028 | 0 | 0 |
| 3.188000000000006 | -0.028 | 0 | 0 |
| 3.192000000000006 | -0.027 | 0 | 0 |
| 3.196000000000006 | -0.026 | 0 | 0 |
| 3.200000000000006 | -0.026 | 0 | 0 |
| 3.204000000000006 | -0.026 | 0 | 0 |
| 3.208000000000006 | -0.025 | 0 | 0 |
| 3.212000000000006 | -0.025 | 0 | 0 |
| 3.216000000000006 | -0.024 | 0 | 0 |
| 3.220000000000006 | -0.024 | 0 | 0 |
| 3.224000000000006 | -0.023 | 0 | 0 |
| 3.228000000000006 | -0.023 | 0 | 0 |
| 3.232000000000006 | -0.022 | 0 | 0 |
| 3.236000000000006 | -0.022 | 0 | 0 |
| 3.240000000000006 | -0.021 | 0 | 0 |
| 3.244000000000006 | -0.021 | 0 | 0 |
| 3.248000000000006 | -0.021 | 0 | 0 |
| 3.252000000000006 | -0.02 | 0 | 0 |
| 3.256000000000006 | -0.02 | 0 | 0 |
| 3.260000000000006 | -0.019 | 0 | 0 |
| 3.264000000000006 | -0.019 | 0 | 0 |
| 3.268000000000006 | -0.019 | 0 | 0 |
| 3.272000000000006 | -0.018 | 0 | 0 |
| 3.276000000000006 | -0.018 | 0 | 0 |
| 3.280000000000006 | -0.018 | 0 | 0 |
| 3.284000000000006 | -0.017 | 0 | 0 |
| 3.288000000000006 | -0.017 | 0 | 0 |
| 3.292000000000006 | -0.017 | 0 | 0 |
| 3.296000000000006 | -0.016 | 0 | 0 |
| 3.300000000000006 | -0.016 | 0 | 0 |
| 3.304000000000006 | -0.016 | 0 | 0 |
| 3.308000000000006 | -0.015 | 0 | 0 |
| 3.312000000000006 | -0.015 | 0 | 0 |
| 3.316000000000006 | -0.015 | 0 | 0 |
| 3.320000000000006 | -0.015 | 0 | 0 |
| 3.324000000000006 | -0.014 | 0 | 0 |
| 3.328000000000006 | -0.014 | 0 | 0 |
| 3.332000000000006 | -0.014 | 0 | 0 |
| 3.336000000000006 | -0.013 | 0 | 0 |
| 3.340000000000006 | -0.013 | 0 | 0 |
| 3.344000000000006 | -0.013 | 0 | 0 |
| 3.348000000000006 | -0.013 | 0 | 0 |
| 3.352000000000006 | -0.012 | 0 | 0 |
| 3.356000000000006 | -0.012 | 0 | 0 |
| 3.360000000000006 | -0.012 | 0 | 0 |
| 3.364000000000006 | -0.012 | 0 | 0 |
| 3.368000000000006 | -0.011 | 0 | 0 |
| 3.372000000000006 | -0.011 | 0 | 0 |
| 3.376000000000006 | -0.011 | 0 | 0 |
| 3.380000000000006 | -0.011 | 0 | 0 |
| 3.384000000000006 | -0.01 | 0 | 0 |
| 3.388000000000006 | -0.01 | 0 | 0 |
| 3.392000000000006 | -0.01 | 0 | 0 |
| 3.396000000000006 | -0.01 | 0 | 0 |
| 3.400000000000006 | -0.01 | 0 | 0 |
| 3.404000000000006 | -0.009 | 0 | 0 |
| 3.408000000000006 | -0.009 | 0 | 0 |
| 3.412000000000006 | -0.009 | 0 | 0 |
| 3.416000000000006 | -0.009 | 0 | 0 |
| 3.420000000000006 | -0.009 | 0 | 0 |
| 3.424000000000006 | -0.009 | 0 | 0 |
| 3.428000000000006 | -0.008 | 0 | 0 |
| 3.432000000000006 | -0.008 | 0 | 0 |
| 3.436000000000006 | -0.008 | 0 | 0 |
| 3.440000000000006 | -0.008 | 0 | 0 |
| 3.444000000000006 | -0.008 | 0 | 0 |
| 3.448000000000006 | -0.007 | 0 | 0 |
| 3.452000000000006 | -0.007 | 0 | 0 |
| 3.456000000000006 | -0.007 | 0 | 0 |
| 3.460000000000006 | -0.007 | 0 | 0 |
| 3.464000000000006 | -0.007 | 0 | 0 |
| 3.468000000000006 | -0.007 | 0 | 0 |
| 3.472000000000006 | -0.007 | 0 | 0 |
| 3.476000000000006 | -0.006 | 0 | 0 |
| 3.480000000000006 | -0.006 | 0 | 0 |
| 3.484000000000006 | -0.006 | 0 | 0 |
| 3.488000000000006 | -0.006 | 0 | 0 |
| 3.492000000000006 | -0.006 | 0 | 0 |
| 3.496000000000006 | -0.006 | 0 | 0 |
| 3.500000000000006 | -0.006 | 0 | 0 |
| 3.504000000000006 | -0.006 | 0 | 0 |
| 3.508000000000006 | -0.005 | 0 | 0 |
| 3.512000000000006 | -0.005 | 0 | 0 |
| 3.516000000000006 | -0.005 | 0 | 0 |
| 3.520000000000006 | -0.005 | 0 | 0 |
| 3.524000000000006 | -0.005 | 0 | 0 |
| 3.528000000000006 | -0.005 | 0 | 0 |
| 3.532000000000006 | -0.005 | 0 | 0 |
| 3.536000000000006 | -0.005 | 0 | 0 |
| 3.540000000000006 | -0.005 | 0 | 0 |
| 3.544000000000006 | -0.004 | 0 | 0 |
| 3.548000000000006 | -0.004 | 0 | 0 |
| 3.552000000000006 | -0.004 | 0 | 0 |
| 3.556000000000006 | -0.004 | 0 | 0 |
| 3.560000000000006 | -0.004 | 0 | 0 |
| 3.564000000000006 | -0.004 | 0 | 0 |
| 3.568000000000006 | -0.004 | 0 | 0 |
| 3.572000000000006 | -0.004 | 0 | 0 |
| 3.576000000000006 | -0.004 | 0 | 0 |
| 3.580000000000006 | -0.004 | 0 | 0 |
| 3.584000000000006 | -0.004 | 0 | 0 |
| 3.588000000000006 | -0.003 | 0 | 0 |
| 3.592000000000006 | -0.003 | 0 | 0 |
| 3.596000000000006 | -0.003 | 0 | 0 |
| 3.600000000000006 | -0.003 | 0 | 0 |
| 3.604000000000006 | -0.003 | 0 | 0 |
| 3.608000000000006 | -0.003 | 0 | 0 |
| 3.612000000000006 | -0.003 | 0 | 0 |
| 3.616000000000006 | -0.003 | 0 | 0 |
| 3.620000000000006 | -0.003 | 0 | 0 |
| 3.624000000000006 | -0.003 | 0 | 0 |
| 3.628000000000006 | -0.003 | 0 | 0 |
| 3.632000000000006 | -0.003 | 0 | 0 |
| 3.636000000000006 | -0.003 | 0 | 0 |
| 3.640000000000006 | -0.003 | 0 | 0 |
| 3.644000000000006 | -0.003 | 0 | 0 |
| 3.648000000000006 | -0.002 | 0 | 0 |
| 3.652000000000006 | -0.002 | 0 | 0 |
| 3.656000000000006 | -0.002 | 0 | 0 |
| 3.660000000000006 | -0.002 | 0 | 0 |
| 3.664000000000006 | -0.002 | 0 | 0 |
| 3.668000000000006 | -0.002 | 0 | 0 |
| 3.672000000000006 | -0.002 | 0 | 0 |
| 3.676000000000006 | -0.002 | 0 | 0 |
| 3.680000000000006 | -0.002 | 0 | 0 |
| 3.684000000000006 | -0.002 | 0 | 0 |
| 3.688000000000006 | -0.002 | 0 | 0 |
| 3.692000000000006 | -0.002 | 0 | 0 |
| 3.696000000000006 | -0.002 | 0 | 0 |
| 3.700000000000006 | -0.002 | 0 | 0 |
| 3.704000000000006 | -0.002 | 0 | 0 |
| 3.708000000000006 | -0.002 | 0 | 0 |
| 3.712000000000006 | -0.002 | 0 | 0 |
| 3.716000000000006 | -0.002 | 0 | 0 |
| 3.720000000000006 | -0.002 | 0 | 0 |
| 3.724000000000006 | -0.002 | 0 | 0 |
| 3.728000000000006 | -0.002 | 0 | 0 |
| 3.732000000000006 | -0.002 | 0 | 0 |
| 3.736000000000006 | -0.001 | 0 | 0 |
| 3.740000000000006 | -0.001 | 0 | 0 |
| 3.744000000000006 | -0.001 | 0 | 0 |
| 3.748000000000006 | -0.001 | 0 | 0 |
| 3.752000000000006 | -0.001 | 0 | 0 |
| 3.756000000000006 | -0.001 | 0 | 0 |
| 3.760000000000006 | -0.001 | 0 | 0 |
| 3.764000000000006 | -0.001 | 0 | 0 |
| 3.768000000000006 | -0.001 | 0 | 0 |
| 3.772000000000006 | -0.001 | 0 | 0 |
| 3.776000000000006 | -0.001 | 0 | 0 |
| 3.780000000000006 | -0.001 | 0 | 0 |
| 3.784000000000006 | -0.001 | 0 | 0 |
| 3.788000000000006 | -0.001 | 0 | 0 |
| 3.792000000000006 | -0.001 | 0 | 0 |
| 3.796000000000006 | -0.001 | 0 | 0 |
| 3.800000000000006 | -0.001 | 0 | 0 |
| 3.804000000000006 | -0.001 | 0 | 0 |
| 3.808000000000006 | -0.001 | 0 | 0 |
| 3.812000000000006 | -0.001 | 0 | 0 |
| 3.816000000000006 | -0.001 | 0 | 0 |
| 3.820000000000006 | -0.001 | 0 | 0 |
| 3.824000000000006 | -0.001 | 0 | 0 |
| 3.828000000000006 | -0.001 | 0 | 0 |
| 3.832000000000006 | -0.001 | 0 | 0 |
| 3.836000000000006 | -0.001 | 0 | 0 |
| 3.840000000000006 | -0.001 | 0 | 0 |
| 3.844000000000006 | -0.001 | 0 | 0 |
| 3.848000000000006 | -0.001 | 0 | 0 |
| 3.852000000000006 | -0.001 | 0 | 0 |
| 3.856000000000006 | -0.001 | 0 | 0 |
| 3.860000000000006 | -0.001 | 0 | 0 |
| 3.864000000000006 | -0.001 | 0 | 0 |
| 3.868000000000006 | -0.001 | 0 | 0 |
| 3.872000000000006 | -0.001 | 0 | 0 |
| 3.876000000000006 | -0.001 | 0 | 0 |
| 3.880000000000006 | -0.001 | 0 | 0 |
| 3.884000000000006 | -0.001 | 0 | 0 |
| 3.888000000000007 | -0.001 | 0 | 0 |
| 3.892000000000006 | -0.001 | 0 | 0 |
| 3.896000000000006 | -0.001 | 0 | 0 |
| 3.900000000000007 | -0.001 | 0 | 0 |
| 3.904000000000007 | -0.001 | 0 | 0 |
| 3.908000000000007 | -0.001 | 0 | 0 |
| 3.912000000000007 | 0 | 0 | 0 |
| 3.916000000000007 | 0 | 0 | 0 |
| 3.920000000000007 | 0 | 0 | 0 |
| 3.924000000000007 | 0 | 0 | 0 |
| 3.928000000000007 | 0 | 0 | 0 |
| 3.932000000000007 | 0 | 0 | 0 |
| 3.936000000000007 | 0 | 0 | 0 |
| 3.940000000000007 | 0 | 0 | 0 |
| 3.944000000000007 | 0 | 0 | 0 |
| 3.948000000000007 | 0 | 0 | 0 |
| 3.952000000000007 | 0 | 0 | 0 |
| 3.956000000000007 | 0 | 0 | 0 |
| 3.960000000000007 | 0 | 0 | 0 |
| 3.964000000000007 | 0 | 0 | 0 |
| 3.968000000000007 | 0 | 0 | 0 |
| 3.972000000000007 | 0 | 0 | 0 |
| 3.976000000000007 | 0 | 0 | 0 |
| 3.980000000000007 | 0 | 0 | 0 |
| 3.984000000000007 | 0 | 0 | 0 |
| 3.988000000000007 | 0 | 0 | 0 |
| 3.992000000000007 | 0 | 0 | 0 |
| 3.996000000000007 | 0 | 0 | 0 |
| 4.000000000000006 | 0 | 0 | 0 |